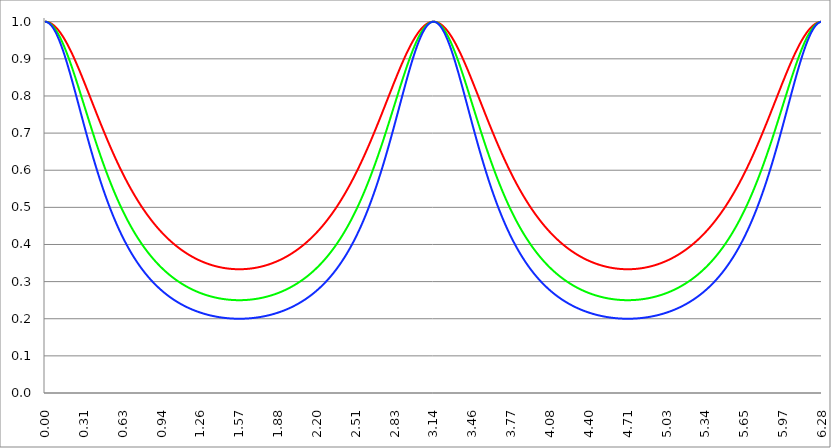
| Category | Series 1 | Series 0 | Series 2 |
|---|---|---|---|
| 0.0 | 1 | 1 | 1 |
| 0.00314159265358979 | 1 | 1 | 1 |
| 0.00628318530717958 | 1 | 1 | 1 |
| 0.00942477796076938 | 1 | 1 | 1 |
| 0.0125663706143592 | 1 | 1 | 0.999 |
| 0.015707963267949 | 1 | 0.999 | 0.999 |
| 0.0188495559215388 | 0.999 | 0.999 | 0.999 |
| 0.0219911485751285 | 0.999 | 0.999 | 0.998 |
| 0.0251327412287183 | 0.999 | 0.998 | 0.997 |
| 0.0282743338823081 | 0.998 | 0.998 | 0.997 |
| 0.0314159265358979 | 0.998 | 0.997 | 0.996 |
| 0.0345575191894877 | 0.998 | 0.996 | 0.995 |
| 0.0376991118430775 | 0.997 | 0.996 | 0.994 |
| 0.0408407044966673 | 0.997 | 0.995 | 0.993 |
| 0.0439822971502571 | 0.996 | 0.994 | 0.992 |
| 0.0471238898038469 | 0.996 | 0.993 | 0.991 |
| 0.0502654824574367 | 0.995 | 0.992 | 0.99 |
| 0.0534070751110265 | 0.994 | 0.992 | 0.989 |
| 0.0565486677646163 | 0.994 | 0.991 | 0.987 |
| 0.059690260418206 | 0.993 | 0.989 | 0.986 |
| 0.0628318530717958 | 0.992 | 0.988 | 0.984 |
| 0.0659734457253856 | 0.991 | 0.987 | 0.983 |
| 0.0691150383789754 | 0.991 | 0.986 | 0.981 |
| 0.0722566310325652 | 0.99 | 0.985 | 0.98 |
| 0.075398223686155 | 0.989 | 0.983 | 0.978 |
| 0.0785398163397448 | 0.988 | 0.982 | 0.976 |
| 0.0816814089933346 | 0.987 | 0.98 | 0.974 |
| 0.0848230016469244 | 0.986 | 0.979 | 0.972 |
| 0.0879645943005142 | 0.985 | 0.977 | 0.97 |
| 0.091106186954104 | 0.984 | 0.976 | 0.968 |
| 0.0942477796076937 | 0.983 | 0.974 | 0.966 |
| 0.0973893722612835 | 0.981 | 0.972 | 0.964 |
| 0.100530964914873 | 0.98 | 0.971 | 0.961 |
| 0.103672557568463 | 0.979 | 0.969 | 0.959 |
| 0.106814150222053 | 0.978 | 0.967 | 0.957 |
| 0.109955742875643 | 0.976 | 0.965 | 0.954 |
| 0.113097335529233 | 0.975 | 0.963 | 0.952 |
| 0.116238928182822 | 0.974 | 0.961 | 0.949 |
| 0.119380520836412 | 0.972 | 0.959 | 0.946 |
| 0.122522113490002 | 0.971 | 0.957 | 0.944 |
| 0.125663706143592 | 0.97 | 0.955 | 0.941 |
| 0.128805298797181 | 0.968 | 0.953 | 0.938 |
| 0.131946891450771 | 0.967 | 0.951 | 0.935 |
| 0.135088484104361 | 0.965 | 0.948 | 0.932 |
| 0.138230076757951 | 0.963 | 0.946 | 0.929 |
| 0.141371669411541 | 0.962 | 0.944 | 0.926 |
| 0.14451326206513 | 0.96 | 0.941 | 0.923 |
| 0.14765485471872 | 0.959 | 0.939 | 0.92 |
| 0.15079644737231 | 0.957 | 0.937 | 0.917 |
| 0.1539380400259 | 0.955 | 0.934 | 0.914 |
| 0.15707963267949 | 0.953 | 0.932 | 0.911 |
| 0.160221225333079 | 0.952 | 0.929 | 0.908 |
| 0.163362817986669 | 0.95 | 0.926 | 0.904 |
| 0.166504410640259 | 0.948 | 0.924 | 0.901 |
| 0.169646003293849 | 0.946 | 0.921 | 0.898 |
| 0.172787595947439 | 0.944 | 0.919 | 0.894 |
| 0.175929188601028 | 0.942 | 0.916 | 0.891 |
| 0.179070781254618 | 0.94 | 0.913 | 0.887 |
| 0.182212373908208 | 0.938 | 0.91 | 0.884 |
| 0.185353966561798 | 0.936 | 0.908 | 0.88 |
| 0.188495559215388 | 0.934 | 0.905 | 0.877 |
| 0.191637151868977 | 0.932 | 0.902 | 0.873 |
| 0.194778744522567 | 0.93 | 0.899 | 0.87 |
| 0.197920337176157 | 0.928 | 0.896 | 0.866 |
| 0.201061929829747 | 0.926 | 0.893 | 0.862 |
| 0.204203522483336 | 0.924 | 0.89 | 0.859 |
| 0.207345115136926 | 0.922 | 0.887 | 0.855 |
| 0.210486707790516 | 0.92 | 0.884 | 0.851 |
| 0.213628300444106 | 0.918 | 0.881 | 0.848 |
| 0.216769893097696 | 0.915 | 0.878 | 0.844 |
| 0.219911485751285 | 0.913 | 0.875 | 0.84 |
| 0.223053078404875 | 0.911 | 0.872 | 0.836 |
| 0.226194671058465 | 0.909 | 0.869 | 0.833 |
| 0.229336263712055 | 0.906 | 0.866 | 0.829 |
| 0.232477856365645 | 0.904 | 0.863 | 0.825 |
| 0.235619449019234 | 0.902 | 0.859 | 0.821 |
| 0.238761041672824 | 0.899 | 0.856 | 0.817 |
| 0.241902634326414 | 0.897 | 0.853 | 0.813 |
| 0.245044226980004 | 0.895 | 0.85 | 0.809 |
| 0.248185819633594 | 0.892 | 0.847 | 0.806 |
| 0.251327412287183 | 0.89 | 0.843 | 0.802 |
| 0.254469004940773 | 0.888 | 0.84 | 0.798 |
| 0.257610597594363 | 0.885 | 0.837 | 0.794 |
| 0.260752190247953 | 0.883 | 0.834 | 0.79 |
| 0.263893782901543 | 0.88 | 0.83 | 0.786 |
| 0.267035375555132 | 0.878 | 0.827 | 0.782 |
| 0.270176968208722 | 0.875 | 0.824 | 0.778 |
| 0.273318560862312 | 0.873 | 0.821 | 0.774 |
| 0.276460153515902 | 0.87 | 0.817 | 0.77 |
| 0.279601746169492 | 0.868 | 0.814 | 0.766 |
| 0.282743338823082 | 0.865 | 0.811 | 0.763 |
| 0.285884931476671 | 0.863 | 0.807 | 0.759 |
| 0.289026524130261 | 0.86 | 0.804 | 0.755 |
| 0.292168116783851 | 0.858 | 0.801 | 0.751 |
| 0.295309709437441 | 0.855 | 0.797 | 0.747 |
| 0.298451302091031 | 0.853 | 0.794 | 0.743 |
| 0.30159289474462 | 0.85 | 0.791 | 0.739 |
| 0.30473448739821 | 0.847 | 0.787 | 0.735 |
| 0.3078760800518 | 0.845 | 0.784 | 0.731 |
| 0.31101767270539 | 0.842 | 0.781 | 0.727 |
| 0.31415926535898 | 0.84 | 0.777 | 0.724 |
| 0.31730085801257 | 0.837 | 0.774 | 0.72 |
| 0.320442450666159 | 0.834 | 0.771 | 0.716 |
| 0.323584043319749 | 0.832 | 0.767 | 0.712 |
| 0.326725635973339 | 0.829 | 0.764 | 0.708 |
| 0.329867228626929 | 0.827 | 0.761 | 0.704 |
| 0.333008821280519 | 0.824 | 0.757 | 0.701 |
| 0.336150413934108 | 0.821 | 0.754 | 0.697 |
| 0.339292006587698 | 0.819 | 0.751 | 0.693 |
| 0.342433599241288 | 0.816 | 0.747 | 0.689 |
| 0.345575191894878 | 0.813 | 0.744 | 0.685 |
| 0.348716784548468 | 0.811 | 0.741 | 0.682 |
| 0.351858377202058 | 0.808 | 0.737 | 0.678 |
| 0.354999969855647 | 0.805 | 0.734 | 0.674 |
| 0.358141562509237 | 0.803 | 0.731 | 0.67 |
| 0.361283155162827 | 0.8 | 0.727 | 0.667 |
| 0.364424747816417 | 0.797 | 0.724 | 0.663 |
| 0.367566340470007 | 0.795 | 0.721 | 0.659 |
| 0.370707933123597 | 0.792 | 0.717 | 0.656 |
| 0.373849525777186 | 0.789 | 0.714 | 0.652 |
| 0.376991118430776 | 0.787 | 0.711 | 0.648 |
| 0.380132711084366 | 0.784 | 0.708 | 0.645 |
| 0.383274303737956 | 0.781 | 0.704 | 0.641 |
| 0.386415896391546 | 0.779 | 0.701 | 0.638 |
| 0.389557489045135 | 0.776 | 0.698 | 0.634 |
| 0.392699081698725 | 0.773 | 0.695 | 0.631 |
| 0.395840674352315 | 0.771 | 0.692 | 0.627 |
| 0.398982267005905 | 0.768 | 0.688 | 0.624 |
| 0.402123859659495 | 0.765 | 0.685 | 0.62 |
| 0.405265452313085 | 0.763 | 0.682 | 0.617 |
| 0.408407044966674 | 0.76 | 0.679 | 0.613 |
| 0.411548637620264 | 0.758 | 0.676 | 0.61 |
| 0.414690230273854 | 0.755 | 0.672 | 0.606 |
| 0.417831822927444 | 0.752 | 0.669 | 0.603 |
| 0.420973415581034 | 0.75 | 0.666 | 0.6 |
| 0.424115008234623 | 0.747 | 0.663 | 0.596 |
| 0.427256600888213 | 0.744 | 0.66 | 0.593 |
| 0.430398193541803 | 0.742 | 0.657 | 0.59 |
| 0.433539786195393 | 0.739 | 0.654 | 0.586 |
| 0.436681378848983 | 0.737 | 0.651 | 0.583 |
| 0.439822971502573 | 0.734 | 0.648 | 0.58 |
| 0.442964564156162 | 0.731 | 0.645 | 0.576 |
| 0.446106156809752 | 0.729 | 0.642 | 0.573 |
| 0.449247749463342 | 0.726 | 0.639 | 0.57 |
| 0.452389342116932 | 0.724 | 0.636 | 0.567 |
| 0.455530934770522 | 0.721 | 0.633 | 0.564 |
| 0.458672527424111 | 0.718 | 0.63 | 0.56 |
| 0.461814120077701 | 0.716 | 0.627 | 0.557 |
| 0.464955712731291 | 0.713 | 0.624 | 0.554 |
| 0.468097305384881 | 0.711 | 0.621 | 0.551 |
| 0.471238898038471 | 0.708 | 0.618 | 0.548 |
| 0.474380490692061 | 0.706 | 0.615 | 0.545 |
| 0.47752208334565 | 0.703 | 0.612 | 0.542 |
| 0.48066367599924 | 0.7 | 0.609 | 0.539 |
| 0.48380526865283 | 0.698 | 0.606 | 0.536 |
| 0.48694686130642 | 0.695 | 0.604 | 0.533 |
| 0.49008845396001 | 0.693 | 0.601 | 0.53 |
| 0.493230046613599 | 0.69 | 0.598 | 0.527 |
| 0.496371639267189 | 0.688 | 0.595 | 0.524 |
| 0.499513231920779 | 0.685 | 0.592 | 0.521 |
| 0.502654824574369 | 0.683 | 0.59 | 0.519 |
| 0.505796417227959 | 0.681 | 0.587 | 0.516 |
| 0.508938009881549 | 0.678 | 0.584 | 0.513 |
| 0.512079602535138 | 0.676 | 0.581 | 0.51 |
| 0.515221195188728 | 0.673 | 0.579 | 0.507 |
| 0.518362787842318 | 0.671 | 0.576 | 0.505 |
| 0.521504380495908 | 0.668 | 0.573 | 0.502 |
| 0.524645973149498 | 0.666 | 0.571 | 0.499 |
| 0.527787565803087 | 0.663 | 0.568 | 0.496 |
| 0.530929158456677 | 0.661 | 0.565 | 0.494 |
| 0.534070751110267 | 0.659 | 0.563 | 0.491 |
| 0.537212343763857 | 0.656 | 0.56 | 0.488 |
| 0.540353936417447 | 0.654 | 0.557 | 0.486 |
| 0.543495529071037 | 0.652 | 0.555 | 0.483 |
| 0.546637121724626 | 0.649 | 0.552 | 0.481 |
| 0.549778714378216 | 0.647 | 0.55 | 0.478 |
| 0.552920307031806 | 0.644 | 0.547 | 0.475 |
| 0.556061899685396 | 0.642 | 0.545 | 0.473 |
| 0.559203492338986 | 0.64 | 0.542 | 0.47 |
| 0.562345084992576 | 0.638 | 0.54 | 0.468 |
| 0.565486677646165 | 0.635 | 0.537 | 0.465 |
| 0.568628270299755 | 0.633 | 0.535 | 0.463 |
| 0.571769862953345 | 0.631 | 0.532 | 0.461 |
| 0.574911455606935 | 0.628 | 0.53 | 0.458 |
| 0.578053048260525 | 0.626 | 0.528 | 0.456 |
| 0.581194640914114 | 0.624 | 0.525 | 0.453 |
| 0.584336233567704 | 0.622 | 0.523 | 0.451 |
| 0.587477826221294 | 0.619 | 0.52 | 0.449 |
| 0.590619418874884 | 0.617 | 0.518 | 0.446 |
| 0.593761011528474 | 0.615 | 0.516 | 0.444 |
| 0.596902604182064 | 0.613 | 0.513 | 0.442 |
| 0.600044196835653 | 0.611 | 0.511 | 0.439 |
| 0.603185789489243 | 0.608 | 0.509 | 0.437 |
| 0.606327382142833 | 0.606 | 0.507 | 0.435 |
| 0.609468974796423 | 0.604 | 0.504 | 0.433 |
| 0.612610567450013 | 0.602 | 0.502 | 0.431 |
| 0.615752160103602 | 0.6 | 0.5 | 0.428 |
| 0.618893752757192 | 0.598 | 0.498 | 0.426 |
| 0.622035345410782 | 0.596 | 0.495 | 0.424 |
| 0.625176938064372 | 0.593 | 0.493 | 0.422 |
| 0.628318530717962 | 0.591 | 0.491 | 0.42 |
| 0.631460123371551 | 0.589 | 0.489 | 0.418 |
| 0.634601716025141 | 0.587 | 0.487 | 0.416 |
| 0.637743308678731 | 0.585 | 0.485 | 0.414 |
| 0.640884901332321 | 0.583 | 0.483 | 0.412 |
| 0.644026493985911 | 0.581 | 0.48 | 0.409 |
| 0.647168086639501 | 0.579 | 0.478 | 0.407 |
| 0.65030967929309 | 0.577 | 0.476 | 0.405 |
| 0.65345127194668 | 0.575 | 0.474 | 0.403 |
| 0.65659286460027 | 0.573 | 0.472 | 0.402 |
| 0.65973445725386 | 0.571 | 0.47 | 0.4 |
| 0.66287604990745 | 0.569 | 0.468 | 0.398 |
| 0.666017642561039 | 0.567 | 0.466 | 0.396 |
| 0.669159235214629 | 0.565 | 0.464 | 0.394 |
| 0.672300827868219 | 0.563 | 0.462 | 0.392 |
| 0.675442420521809 | 0.561 | 0.46 | 0.39 |
| 0.678584013175399 | 0.559 | 0.458 | 0.388 |
| 0.681725605828989 | 0.557 | 0.456 | 0.386 |
| 0.684867198482578 | 0.555 | 0.454 | 0.385 |
| 0.688008791136168 | 0.554 | 0.453 | 0.383 |
| 0.691150383789758 | 0.552 | 0.451 | 0.381 |
| 0.694291976443348 | 0.55 | 0.449 | 0.379 |
| 0.697433569096938 | 0.548 | 0.447 | 0.377 |
| 0.700575161750528 | 0.546 | 0.445 | 0.376 |
| 0.703716754404117 | 0.544 | 0.443 | 0.374 |
| 0.706858347057707 | 0.542 | 0.441 | 0.372 |
| 0.709999939711297 | 0.541 | 0.44 | 0.37 |
| 0.713141532364887 | 0.539 | 0.438 | 0.369 |
| 0.716283125018477 | 0.537 | 0.436 | 0.367 |
| 0.719424717672066 | 0.535 | 0.434 | 0.365 |
| 0.722566310325656 | 0.533 | 0.433 | 0.364 |
| 0.725707902979246 | 0.532 | 0.431 | 0.362 |
| 0.728849495632836 | 0.53 | 0.429 | 0.36 |
| 0.731991088286426 | 0.528 | 0.427 | 0.359 |
| 0.735132680940016 | 0.526 | 0.426 | 0.357 |
| 0.738274273593605 | 0.525 | 0.424 | 0.356 |
| 0.741415866247195 | 0.523 | 0.422 | 0.354 |
| 0.744557458900785 | 0.521 | 0.421 | 0.353 |
| 0.747699051554375 | 0.52 | 0.419 | 0.351 |
| 0.750840644207965 | 0.518 | 0.417 | 0.349 |
| 0.753982236861554 | 0.516 | 0.416 | 0.348 |
| 0.757123829515144 | 0.515 | 0.414 | 0.346 |
| 0.760265422168734 | 0.513 | 0.412 | 0.345 |
| 0.763407014822324 | 0.511 | 0.411 | 0.343 |
| 0.766548607475914 | 0.51 | 0.409 | 0.342 |
| 0.769690200129504 | 0.508 | 0.408 | 0.34 |
| 0.772831792783093 | 0.506 | 0.406 | 0.339 |
| 0.775973385436683 | 0.505 | 0.405 | 0.338 |
| 0.779114978090273 | 0.503 | 0.403 | 0.336 |
| 0.782256570743863 | 0.502 | 0.402 | 0.335 |
| 0.785398163397453 | 0.5 | 0.4 | 0.333 |
| 0.788539756051042 | 0.498 | 0.398 | 0.332 |
| 0.791681348704632 | 0.497 | 0.397 | 0.331 |
| 0.794822941358222 | 0.495 | 0.396 | 0.329 |
| 0.797964534011812 | 0.494 | 0.394 | 0.328 |
| 0.801106126665402 | 0.492 | 0.393 | 0.326 |
| 0.804247719318992 | 0.491 | 0.391 | 0.325 |
| 0.807389311972581 | 0.489 | 0.39 | 0.324 |
| 0.810530904626171 | 0.488 | 0.388 | 0.323 |
| 0.813672497279761 | 0.486 | 0.387 | 0.321 |
| 0.816814089933351 | 0.485 | 0.385 | 0.32 |
| 0.819955682586941 | 0.483 | 0.384 | 0.319 |
| 0.823097275240531 | 0.482 | 0.383 | 0.317 |
| 0.82623886789412 | 0.48 | 0.381 | 0.316 |
| 0.82938046054771 | 0.479 | 0.38 | 0.315 |
| 0.8325220532013 | 0.478 | 0.379 | 0.314 |
| 0.83566364585489 | 0.476 | 0.377 | 0.312 |
| 0.83880523850848 | 0.475 | 0.376 | 0.311 |
| 0.841946831162069 | 0.473 | 0.375 | 0.31 |
| 0.845088423815659 | 0.472 | 0.373 | 0.309 |
| 0.848230016469249 | 0.471 | 0.372 | 0.308 |
| 0.851371609122839 | 0.469 | 0.371 | 0.306 |
| 0.854513201776429 | 0.468 | 0.369 | 0.305 |
| 0.857654794430019 | 0.466 | 0.368 | 0.304 |
| 0.860796387083608 | 0.465 | 0.367 | 0.303 |
| 0.863937979737198 | 0.464 | 0.366 | 0.302 |
| 0.867079572390788 | 0.462 | 0.364 | 0.301 |
| 0.870221165044378 | 0.461 | 0.363 | 0.3 |
| 0.873362757697968 | 0.46 | 0.362 | 0.299 |
| 0.876504350351557 | 0.458 | 0.361 | 0.297 |
| 0.879645943005147 | 0.457 | 0.36 | 0.296 |
| 0.882787535658737 | 0.456 | 0.358 | 0.295 |
| 0.885929128312327 | 0.455 | 0.357 | 0.294 |
| 0.889070720965917 | 0.453 | 0.356 | 0.293 |
| 0.892212313619507 | 0.452 | 0.355 | 0.292 |
| 0.895353906273096 | 0.451 | 0.354 | 0.291 |
| 0.898495498926686 | 0.45 | 0.353 | 0.29 |
| 0.901637091580276 | 0.448 | 0.351 | 0.289 |
| 0.904778684233866 | 0.447 | 0.35 | 0.288 |
| 0.907920276887456 | 0.446 | 0.349 | 0.287 |
| 0.911061869541045 | 0.445 | 0.348 | 0.286 |
| 0.914203462194635 | 0.444 | 0.347 | 0.285 |
| 0.917345054848225 | 0.442 | 0.346 | 0.284 |
| 0.920486647501815 | 0.441 | 0.345 | 0.283 |
| 0.923628240155405 | 0.44 | 0.344 | 0.282 |
| 0.926769832808995 | 0.439 | 0.343 | 0.281 |
| 0.929911425462584 | 0.438 | 0.342 | 0.28 |
| 0.933053018116174 | 0.436 | 0.341 | 0.279 |
| 0.936194610769764 | 0.435 | 0.339 | 0.278 |
| 0.939336203423354 | 0.434 | 0.338 | 0.277 |
| 0.942477796076944 | 0.433 | 0.337 | 0.276 |
| 0.945619388730533 | 0.432 | 0.336 | 0.275 |
| 0.948760981384123 | 0.431 | 0.335 | 0.275 |
| 0.951902574037713 | 0.43 | 0.334 | 0.274 |
| 0.955044166691303 | 0.429 | 0.333 | 0.273 |
| 0.958185759344893 | 0.428 | 0.332 | 0.272 |
| 0.961327351998483 | 0.427 | 0.331 | 0.271 |
| 0.964468944652072 | 0.425 | 0.33 | 0.27 |
| 0.967610537305662 | 0.424 | 0.33 | 0.269 |
| 0.970752129959252 | 0.423 | 0.329 | 0.268 |
| 0.973893722612842 | 0.422 | 0.328 | 0.268 |
| 0.977035315266432 | 0.421 | 0.327 | 0.267 |
| 0.980176907920022 | 0.42 | 0.326 | 0.266 |
| 0.983318500573611 | 0.419 | 0.325 | 0.265 |
| 0.986460093227201 | 0.418 | 0.324 | 0.264 |
| 0.989601685880791 | 0.417 | 0.323 | 0.264 |
| 0.992743278534381 | 0.416 | 0.322 | 0.263 |
| 0.995884871187971 | 0.415 | 0.321 | 0.262 |
| 0.99902646384156 | 0.414 | 0.32 | 0.261 |
| 1.00216805649515 | 0.413 | 0.319 | 0.26 |
| 1.00530964914874 | 0.412 | 0.319 | 0.26 |
| 1.00845124180233 | 0.411 | 0.318 | 0.259 |
| 1.01159283445592 | 0.41 | 0.317 | 0.258 |
| 1.01473442710951 | 0.409 | 0.316 | 0.257 |
| 1.017876019763099 | 0.408 | 0.315 | 0.257 |
| 1.021017612416689 | 0.407 | 0.314 | 0.256 |
| 1.02415920507028 | 0.407 | 0.314 | 0.255 |
| 1.027300797723869 | 0.406 | 0.313 | 0.254 |
| 1.030442390377459 | 0.405 | 0.312 | 0.254 |
| 1.033583983031048 | 0.404 | 0.311 | 0.253 |
| 1.036725575684638 | 0.403 | 0.31 | 0.252 |
| 1.039867168338228 | 0.402 | 0.31 | 0.252 |
| 1.043008760991818 | 0.401 | 0.309 | 0.251 |
| 1.046150353645408 | 0.4 | 0.308 | 0.25 |
| 1.049291946298998 | 0.399 | 0.307 | 0.25 |
| 1.052433538952587 | 0.399 | 0.306 | 0.249 |
| 1.055575131606177 | 0.398 | 0.306 | 0.248 |
| 1.058716724259767 | 0.397 | 0.305 | 0.248 |
| 1.061858316913357 | 0.396 | 0.304 | 0.247 |
| 1.064999909566947 | 0.395 | 0.303 | 0.246 |
| 1.068141502220536 | 0.394 | 0.303 | 0.246 |
| 1.071283094874126 | 0.394 | 0.302 | 0.245 |
| 1.074424687527716 | 0.393 | 0.301 | 0.244 |
| 1.077566280181306 | 0.392 | 0.301 | 0.244 |
| 1.080707872834896 | 0.391 | 0.3 | 0.243 |
| 1.083849465488486 | 0.39 | 0.299 | 0.242 |
| 1.086991058142075 | 0.39 | 0.298 | 0.242 |
| 1.090132650795665 | 0.389 | 0.298 | 0.241 |
| 1.093274243449255 | 0.388 | 0.297 | 0.241 |
| 1.096415836102845 | 0.387 | 0.296 | 0.24 |
| 1.099557428756435 | 0.386 | 0.296 | 0.239 |
| 1.102699021410025 | 0.386 | 0.295 | 0.239 |
| 1.105840614063614 | 0.385 | 0.294 | 0.238 |
| 1.108982206717204 | 0.384 | 0.294 | 0.238 |
| 1.112123799370794 | 0.383 | 0.293 | 0.237 |
| 1.115265392024384 | 0.383 | 0.292 | 0.237 |
| 1.118406984677974 | 0.382 | 0.292 | 0.236 |
| 1.121548577331563 | 0.381 | 0.291 | 0.236 |
| 1.124690169985153 | 0.381 | 0.291 | 0.235 |
| 1.127831762638743 | 0.38 | 0.29 | 0.234 |
| 1.130973355292333 | 0.379 | 0.289 | 0.234 |
| 1.134114947945923 | 0.378 | 0.289 | 0.233 |
| 1.137256540599513 | 0.378 | 0.288 | 0.233 |
| 1.140398133253102 | 0.377 | 0.288 | 0.232 |
| 1.143539725906692 | 0.376 | 0.287 | 0.232 |
| 1.146681318560282 | 0.376 | 0.286 | 0.231 |
| 1.149822911213872 | 0.375 | 0.286 | 0.231 |
| 1.152964503867462 | 0.374 | 0.285 | 0.23 |
| 1.156106096521051 | 0.374 | 0.285 | 0.23 |
| 1.159247689174641 | 0.373 | 0.284 | 0.229 |
| 1.162389281828231 | 0.373 | 0.284 | 0.229 |
| 1.165530874481821 | 0.372 | 0.283 | 0.228 |
| 1.168672467135411 | 0.371 | 0.282 | 0.228 |
| 1.171814059789001 | 0.371 | 0.282 | 0.227 |
| 1.17495565244259 | 0.37 | 0.281 | 0.227 |
| 1.17809724509618 | 0.369 | 0.281 | 0.227 |
| 1.18123883774977 | 0.369 | 0.28 | 0.226 |
| 1.18438043040336 | 0.368 | 0.28 | 0.226 |
| 1.18752202305695 | 0.368 | 0.279 | 0.225 |
| 1.190663615710539 | 0.367 | 0.279 | 0.225 |
| 1.193805208364129 | 0.366 | 0.278 | 0.224 |
| 1.19694680101772 | 0.366 | 0.278 | 0.224 |
| 1.200088393671309 | 0.365 | 0.277 | 0.223 |
| 1.203229986324899 | 0.365 | 0.277 | 0.223 |
| 1.206371578978489 | 0.364 | 0.276 | 0.223 |
| 1.209513171632078 | 0.364 | 0.276 | 0.222 |
| 1.212654764285668 | 0.363 | 0.275 | 0.222 |
| 1.215796356939258 | 0.363 | 0.275 | 0.221 |
| 1.218937949592848 | 0.362 | 0.274 | 0.221 |
| 1.222079542246438 | 0.361 | 0.274 | 0.221 |
| 1.225221134900027 | 0.361 | 0.274 | 0.22 |
| 1.228362727553617 | 0.36 | 0.273 | 0.22 |
| 1.231504320207207 | 0.36 | 0.273 | 0.219 |
| 1.234645912860797 | 0.359 | 0.272 | 0.219 |
| 1.237787505514387 | 0.359 | 0.272 | 0.219 |
| 1.240929098167977 | 0.358 | 0.271 | 0.218 |
| 1.244070690821566 | 0.358 | 0.271 | 0.218 |
| 1.247212283475156 | 0.357 | 0.271 | 0.218 |
| 1.250353876128746 | 0.357 | 0.27 | 0.217 |
| 1.253495468782336 | 0.356 | 0.27 | 0.217 |
| 1.256637061435926 | 0.356 | 0.269 | 0.217 |
| 1.259778654089515 | 0.356 | 0.269 | 0.216 |
| 1.262920246743105 | 0.355 | 0.268 | 0.216 |
| 1.266061839396695 | 0.355 | 0.268 | 0.216 |
| 1.269203432050285 | 0.354 | 0.268 | 0.215 |
| 1.272345024703875 | 0.354 | 0.267 | 0.215 |
| 1.275486617357465 | 0.353 | 0.267 | 0.215 |
| 1.278628210011054 | 0.353 | 0.267 | 0.214 |
| 1.281769802664644 | 0.352 | 0.266 | 0.214 |
| 1.284911395318234 | 0.352 | 0.266 | 0.214 |
| 1.288052987971824 | 0.352 | 0.265 | 0.213 |
| 1.291194580625414 | 0.351 | 0.265 | 0.213 |
| 1.294336173279003 | 0.351 | 0.265 | 0.213 |
| 1.297477765932593 | 0.35 | 0.264 | 0.212 |
| 1.300619358586183 | 0.35 | 0.264 | 0.212 |
| 1.303760951239773 | 0.35 | 0.264 | 0.212 |
| 1.306902543893363 | 0.349 | 0.263 | 0.212 |
| 1.310044136546953 | 0.349 | 0.263 | 0.211 |
| 1.313185729200542 | 0.348 | 0.263 | 0.211 |
| 1.316327321854132 | 0.348 | 0.262 | 0.211 |
| 1.319468914507722 | 0.348 | 0.262 | 0.21 |
| 1.322610507161312 | 0.347 | 0.262 | 0.21 |
| 1.325752099814902 | 0.347 | 0.262 | 0.21 |
| 1.328893692468491 | 0.347 | 0.261 | 0.21 |
| 1.332035285122081 | 0.346 | 0.261 | 0.209 |
| 1.335176877775671 | 0.346 | 0.261 | 0.209 |
| 1.338318470429261 | 0.346 | 0.26 | 0.209 |
| 1.341460063082851 | 0.345 | 0.26 | 0.209 |
| 1.344601655736441 | 0.345 | 0.26 | 0.208 |
| 1.34774324839003 | 0.345 | 0.26 | 0.208 |
| 1.35088484104362 | 0.344 | 0.259 | 0.208 |
| 1.35402643369721 | 0.344 | 0.259 | 0.208 |
| 1.3571680263508 | 0.344 | 0.259 | 0.207 |
| 1.36030961900439 | 0.343 | 0.258 | 0.207 |
| 1.363451211657979 | 0.343 | 0.258 | 0.207 |
| 1.36659280431157 | 0.343 | 0.258 | 0.207 |
| 1.369734396965159 | 0.342 | 0.258 | 0.207 |
| 1.372875989618749 | 0.342 | 0.257 | 0.206 |
| 1.376017582272339 | 0.342 | 0.257 | 0.206 |
| 1.379159174925929 | 0.342 | 0.257 | 0.206 |
| 1.382300767579518 | 0.341 | 0.257 | 0.206 |
| 1.385442360233108 | 0.341 | 0.257 | 0.206 |
| 1.388583952886698 | 0.341 | 0.256 | 0.205 |
| 1.391725545540288 | 0.341 | 0.256 | 0.205 |
| 1.394867138193878 | 0.34 | 0.256 | 0.205 |
| 1.398008730847468 | 0.34 | 0.256 | 0.205 |
| 1.401150323501057 | 0.34 | 0.255 | 0.205 |
| 1.404291916154647 | 0.34 | 0.255 | 0.204 |
| 1.407433508808237 | 0.339 | 0.255 | 0.204 |
| 1.410575101461827 | 0.339 | 0.255 | 0.204 |
| 1.413716694115417 | 0.339 | 0.255 | 0.204 |
| 1.416858286769006 | 0.339 | 0.254 | 0.204 |
| 1.419999879422596 | 0.338 | 0.254 | 0.204 |
| 1.423141472076186 | 0.338 | 0.254 | 0.204 |
| 1.426283064729776 | 0.338 | 0.254 | 0.203 |
| 1.429424657383366 | 0.338 | 0.254 | 0.203 |
| 1.432566250036956 | 0.338 | 0.254 | 0.203 |
| 1.435707842690545 | 0.337 | 0.253 | 0.203 |
| 1.438849435344135 | 0.337 | 0.253 | 0.203 |
| 1.441991027997725 | 0.337 | 0.253 | 0.203 |
| 1.445132620651315 | 0.337 | 0.253 | 0.203 |
| 1.448274213304905 | 0.337 | 0.253 | 0.202 |
| 1.451415805958494 | 0.337 | 0.253 | 0.202 |
| 1.454557398612084 | 0.336 | 0.253 | 0.202 |
| 1.457698991265674 | 0.336 | 0.252 | 0.202 |
| 1.460840583919264 | 0.336 | 0.252 | 0.202 |
| 1.463982176572854 | 0.336 | 0.252 | 0.202 |
| 1.467123769226444 | 0.336 | 0.252 | 0.202 |
| 1.470265361880033 | 0.336 | 0.252 | 0.202 |
| 1.473406954533623 | 0.335 | 0.252 | 0.202 |
| 1.476548547187213 | 0.335 | 0.252 | 0.201 |
| 1.479690139840803 | 0.335 | 0.252 | 0.201 |
| 1.482831732494393 | 0.335 | 0.251 | 0.201 |
| 1.485973325147982 | 0.335 | 0.251 | 0.201 |
| 1.489114917801572 | 0.335 | 0.251 | 0.201 |
| 1.492256510455162 | 0.335 | 0.251 | 0.201 |
| 1.495398103108752 | 0.335 | 0.251 | 0.201 |
| 1.498539695762342 | 0.334 | 0.251 | 0.201 |
| 1.501681288415932 | 0.334 | 0.251 | 0.201 |
| 1.504822881069521 | 0.334 | 0.251 | 0.201 |
| 1.507964473723111 | 0.334 | 0.251 | 0.201 |
| 1.511106066376701 | 0.334 | 0.251 | 0.201 |
| 1.514247659030291 | 0.334 | 0.251 | 0.201 |
| 1.517389251683881 | 0.334 | 0.251 | 0.2 |
| 1.520530844337471 | 0.334 | 0.25 | 0.2 |
| 1.52367243699106 | 0.334 | 0.25 | 0.2 |
| 1.52681402964465 | 0.334 | 0.25 | 0.2 |
| 1.52995562229824 | 0.334 | 0.25 | 0.2 |
| 1.53309721495183 | 0.334 | 0.25 | 0.2 |
| 1.53623880760542 | 0.334 | 0.25 | 0.2 |
| 1.539380400259009 | 0.334 | 0.25 | 0.2 |
| 1.542521992912599 | 0.334 | 0.25 | 0.2 |
| 1.545663585566189 | 0.333 | 0.25 | 0.2 |
| 1.548805178219779 | 0.333 | 0.25 | 0.2 |
| 1.551946770873369 | 0.333 | 0.25 | 0.2 |
| 1.555088363526959 | 0.333 | 0.25 | 0.2 |
| 1.558229956180548 | 0.333 | 0.25 | 0.2 |
| 1.561371548834138 | 0.333 | 0.25 | 0.2 |
| 1.564513141487728 | 0.333 | 0.25 | 0.2 |
| 1.567654734141318 | 0.333 | 0.25 | 0.2 |
| 1.570796326794908 | 0.333 | 0.25 | 0.2 |
| 1.573937919448497 | 0.333 | 0.25 | 0.2 |
| 1.577079512102087 | 0.333 | 0.25 | 0.2 |
| 1.580221104755677 | 0.333 | 0.25 | 0.2 |
| 1.583362697409267 | 0.333 | 0.25 | 0.2 |
| 1.586504290062857 | 0.333 | 0.25 | 0.2 |
| 1.589645882716447 | 0.333 | 0.25 | 0.2 |
| 1.592787475370036 | 0.333 | 0.25 | 0.2 |
| 1.595929068023626 | 0.333 | 0.25 | 0.2 |
| 1.599070660677216 | 0.334 | 0.25 | 0.2 |
| 1.602212253330806 | 0.334 | 0.25 | 0.2 |
| 1.605353845984396 | 0.334 | 0.25 | 0.2 |
| 1.608495438637985 | 0.334 | 0.25 | 0.2 |
| 1.611637031291575 | 0.334 | 0.25 | 0.2 |
| 1.614778623945165 | 0.334 | 0.25 | 0.2 |
| 1.617920216598755 | 0.334 | 0.25 | 0.2 |
| 1.621061809252345 | 0.334 | 0.25 | 0.2 |
| 1.624203401905935 | 0.334 | 0.251 | 0.2 |
| 1.627344994559524 | 0.334 | 0.251 | 0.201 |
| 1.630486587213114 | 0.334 | 0.251 | 0.201 |
| 1.633628179866704 | 0.334 | 0.251 | 0.201 |
| 1.636769772520294 | 0.334 | 0.251 | 0.201 |
| 1.639911365173884 | 0.334 | 0.251 | 0.201 |
| 1.643052957827473 | 0.334 | 0.251 | 0.201 |
| 1.646194550481063 | 0.335 | 0.251 | 0.201 |
| 1.649336143134653 | 0.335 | 0.251 | 0.201 |
| 1.652477735788243 | 0.335 | 0.251 | 0.201 |
| 1.655619328441833 | 0.335 | 0.251 | 0.201 |
| 1.658760921095423 | 0.335 | 0.251 | 0.201 |
| 1.661902513749012 | 0.335 | 0.252 | 0.201 |
| 1.665044106402602 | 0.335 | 0.252 | 0.201 |
| 1.668185699056192 | 0.335 | 0.252 | 0.202 |
| 1.671327291709782 | 0.336 | 0.252 | 0.202 |
| 1.674468884363372 | 0.336 | 0.252 | 0.202 |
| 1.677610477016961 | 0.336 | 0.252 | 0.202 |
| 1.680752069670551 | 0.336 | 0.252 | 0.202 |
| 1.683893662324141 | 0.336 | 0.252 | 0.202 |
| 1.687035254977731 | 0.336 | 0.253 | 0.202 |
| 1.690176847631321 | 0.337 | 0.253 | 0.202 |
| 1.693318440284911 | 0.337 | 0.253 | 0.202 |
| 1.6964600329385 | 0.337 | 0.253 | 0.203 |
| 1.69960162559209 | 0.337 | 0.253 | 0.203 |
| 1.70274321824568 | 0.337 | 0.253 | 0.203 |
| 1.70588481089927 | 0.337 | 0.253 | 0.203 |
| 1.70902640355286 | 0.338 | 0.254 | 0.203 |
| 1.712167996206449 | 0.338 | 0.254 | 0.203 |
| 1.715309588860039 | 0.338 | 0.254 | 0.203 |
| 1.71845118151363 | 0.338 | 0.254 | 0.204 |
| 1.721592774167219 | 0.338 | 0.254 | 0.204 |
| 1.724734366820809 | 0.339 | 0.254 | 0.204 |
| 1.727875959474399 | 0.339 | 0.255 | 0.204 |
| 1.731017552127988 | 0.339 | 0.255 | 0.204 |
| 1.734159144781578 | 0.339 | 0.255 | 0.204 |
| 1.737300737435168 | 0.34 | 0.255 | 0.204 |
| 1.740442330088758 | 0.34 | 0.255 | 0.205 |
| 1.743583922742348 | 0.34 | 0.256 | 0.205 |
| 1.746725515395937 | 0.34 | 0.256 | 0.205 |
| 1.749867108049527 | 0.341 | 0.256 | 0.205 |
| 1.753008700703117 | 0.341 | 0.256 | 0.205 |
| 1.756150293356707 | 0.341 | 0.257 | 0.206 |
| 1.759291886010297 | 0.341 | 0.257 | 0.206 |
| 1.762433478663887 | 0.342 | 0.257 | 0.206 |
| 1.765575071317476 | 0.342 | 0.257 | 0.206 |
| 1.768716663971066 | 0.342 | 0.257 | 0.206 |
| 1.771858256624656 | 0.342 | 0.258 | 0.207 |
| 1.774999849278246 | 0.343 | 0.258 | 0.207 |
| 1.778141441931836 | 0.343 | 0.258 | 0.207 |
| 1.781283034585426 | 0.343 | 0.258 | 0.207 |
| 1.784424627239015 | 0.344 | 0.259 | 0.207 |
| 1.787566219892605 | 0.344 | 0.259 | 0.208 |
| 1.790707812546195 | 0.344 | 0.259 | 0.208 |
| 1.793849405199785 | 0.345 | 0.26 | 0.208 |
| 1.796990997853375 | 0.345 | 0.26 | 0.208 |
| 1.800132590506964 | 0.345 | 0.26 | 0.209 |
| 1.803274183160554 | 0.346 | 0.26 | 0.209 |
| 1.806415775814144 | 0.346 | 0.261 | 0.209 |
| 1.809557368467734 | 0.346 | 0.261 | 0.209 |
| 1.812698961121324 | 0.347 | 0.261 | 0.21 |
| 1.815840553774914 | 0.347 | 0.262 | 0.21 |
| 1.818982146428503 | 0.347 | 0.262 | 0.21 |
| 1.822123739082093 | 0.348 | 0.262 | 0.21 |
| 1.825265331735683 | 0.348 | 0.262 | 0.211 |
| 1.828406924389273 | 0.348 | 0.263 | 0.211 |
| 1.831548517042863 | 0.349 | 0.263 | 0.211 |
| 1.834690109696452 | 0.349 | 0.263 | 0.212 |
| 1.837831702350042 | 0.35 | 0.264 | 0.212 |
| 1.840973295003632 | 0.35 | 0.264 | 0.212 |
| 1.844114887657222 | 0.35 | 0.264 | 0.212 |
| 1.847256480310812 | 0.351 | 0.265 | 0.213 |
| 1.850398072964402 | 0.351 | 0.265 | 0.213 |
| 1.853539665617991 | 0.352 | 0.265 | 0.213 |
| 1.856681258271581 | 0.352 | 0.266 | 0.214 |
| 1.859822850925171 | 0.352 | 0.266 | 0.214 |
| 1.862964443578761 | 0.353 | 0.267 | 0.214 |
| 1.866106036232351 | 0.353 | 0.267 | 0.215 |
| 1.86924762888594 | 0.354 | 0.267 | 0.215 |
| 1.87238922153953 | 0.354 | 0.268 | 0.215 |
| 1.87553081419312 | 0.355 | 0.268 | 0.216 |
| 1.87867240684671 | 0.355 | 0.268 | 0.216 |
| 1.8818139995003 | 0.356 | 0.269 | 0.216 |
| 1.88495559215389 | 0.356 | 0.269 | 0.217 |
| 1.888097184807479 | 0.356 | 0.27 | 0.217 |
| 1.891238777461069 | 0.357 | 0.27 | 0.217 |
| 1.89438037011466 | 0.357 | 0.271 | 0.218 |
| 1.897521962768249 | 0.358 | 0.271 | 0.218 |
| 1.900663555421839 | 0.358 | 0.271 | 0.218 |
| 1.903805148075429 | 0.359 | 0.272 | 0.219 |
| 1.906946740729018 | 0.359 | 0.272 | 0.219 |
| 1.910088333382608 | 0.36 | 0.273 | 0.219 |
| 1.913229926036198 | 0.36 | 0.273 | 0.22 |
| 1.916371518689788 | 0.361 | 0.274 | 0.22 |
| 1.919513111343378 | 0.361 | 0.274 | 0.221 |
| 1.922654703996967 | 0.362 | 0.274 | 0.221 |
| 1.925796296650557 | 0.363 | 0.275 | 0.221 |
| 1.928937889304147 | 0.363 | 0.275 | 0.222 |
| 1.932079481957737 | 0.364 | 0.276 | 0.222 |
| 1.935221074611327 | 0.364 | 0.276 | 0.223 |
| 1.938362667264917 | 0.365 | 0.277 | 0.223 |
| 1.941504259918506 | 0.365 | 0.277 | 0.223 |
| 1.944645852572096 | 0.366 | 0.278 | 0.224 |
| 1.947787445225686 | 0.366 | 0.278 | 0.224 |
| 1.950929037879276 | 0.367 | 0.279 | 0.225 |
| 1.954070630532866 | 0.368 | 0.279 | 0.225 |
| 1.957212223186455 | 0.368 | 0.28 | 0.226 |
| 1.960353815840045 | 0.369 | 0.28 | 0.226 |
| 1.963495408493635 | 0.369 | 0.281 | 0.227 |
| 1.966637001147225 | 0.37 | 0.281 | 0.227 |
| 1.969778593800815 | 0.371 | 0.282 | 0.227 |
| 1.972920186454405 | 0.371 | 0.282 | 0.228 |
| 1.976061779107994 | 0.372 | 0.283 | 0.228 |
| 1.979203371761584 | 0.373 | 0.284 | 0.229 |
| 1.982344964415174 | 0.373 | 0.284 | 0.229 |
| 1.985486557068764 | 0.374 | 0.285 | 0.23 |
| 1.988628149722354 | 0.374 | 0.285 | 0.23 |
| 1.991769742375943 | 0.375 | 0.286 | 0.231 |
| 1.994911335029533 | 0.376 | 0.286 | 0.231 |
| 1.998052927683123 | 0.376 | 0.287 | 0.232 |
| 2.001194520336712 | 0.377 | 0.288 | 0.232 |
| 2.004336112990302 | 0.378 | 0.288 | 0.233 |
| 2.007477705643892 | 0.378 | 0.289 | 0.233 |
| 2.010619298297482 | 0.379 | 0.289 | 0.234 |
| 2.013760890951071 | 0.38 | 0.29 | 0.234 |
| 2.016902483604661 | 0.381 | 0.291 | 0.235 |
| 2.02004407625825 | 0.381 | 0.291 | 0.236 |
| 2.02318566891184 | 0.382 | 0.292 | 0.236 |
| 2.02632726156543 | 0.383 | 0.292 | 0.237 |
| 2.029468854219019 | 0.383 | 0.293 | 0.237 |
| 2.032610446872609 | 0.384 | 0.294 | 0.238 |
| 2.035752039526198 | 0.385 | 0.294 | 0.238 |
| 2.038893632179788 | 0.386 | 0.295 | 0.239 |
| 2.042035224833378 | 0.386 | 0.296 | 0.239 |
| 2.045176817486967 | 0.387 | 0.296 | 0.24 |
| 2.048318410140557 | 0.388 | 0.297 | 0.241 |
| 2.051460002794146 | 0.389 | 0.298 | 0.241 |
| 2.054601595447736 | 0.39 | 0.298 | 0.242 |
| 2.057743188101325 | 0.39 | 0.299 | 0.242 |
| 2.060884780754915 | 0.391 | 0.3 | 0.243 |
| 2.064026373408505 | 0.392 | 0.301 | 0.244 |
| 2.067167966062094 | 0.393 | 0.301 | 0.244 |
| 2.070309558715684 | 0.394 | 0.302 | 0.245 |
| 2.073451151369273 | 0.394 | 0.303 | 0.246 |
| 2.076592744022863 | 0.395 | 0.303 | 0.246 |
| 2.079734336676452 | 0.396 | 0.304 | 0.247 |
| 2.082875929330042 | 0.397 | 0.305 | 0.248 |
| 2.086017521983632 | 0.398 | 0.306 | 0.248 |
| 2.089159114637221 | 0.399 | 0.306 | 0.249 |
| 2.092300707290811 | 0.399 | 0.307 | 0.25 |
| 2.095442299944401 | 0.4 | 0.308 | 0.25 |
| 2.09858389259799 | 0.401 | 0.309 | 0.251 |
| 2.10172548525158 | 0.402 | 0.31 | 0.252 |
| 2.104867077905169 | 0.403 | 0.31 | 0.252 |
| 2.108008670558759 | 0.404 | 0.311 | 0.253 |
| 2.111150263212349 | 0.405 | 0.312 | 0.254 |
| 2.114291855865938 | 0.406 | 0.313 | 0.254 |
| 2.117433448519528 | 0.407 | 0.314 | 0.255 |
| 2.120575041173117 | 0.407 | 0.314 | 0.256 |
| 2.123716633826707 | 0.408 | 0.315 | 0.257 |
| 2.126858226480297 | 0.409 | 0.316 | 0.257 |
| 2.129999819133886 | 0.41 | 0.317 | 0.258 |
| 2.133141411787476 | 0.411 | 0.318 | 0.259 |
| 2.136283004441065 | 0.412 | 0.319 | 0.26 |
| 2.139424597094655 | 0.413 | 0.319 | 0.26 |
| 2.142566189748245 | 0.414 | 0.32 | 0.261 |
| 2.145707782401834 | 0.415 | 0.321 | 0.262 |
| 2.148849375055424 | 0.416 | 0.322 | 0.263 |
| 2.151990967709013 | 0.417 | 0.323 | 0.264 |
| 2.155132560362603 | 0.418 | 0.324 | 0.264 |
| 2.158274153016193 | 0.419 | 0.325 | 0.265 |
| 2.161415745669782 | 0.42 | 0.326 | 0.266 |
| 2.164557338323372 | 0.421 | 0.327 | 0.267 |
| 2.167698930976961 | 0.422 | 0.328 | 0.268 |
| 2.170840523630551 | 0.423 | 0.329 | 0.268 |
| 2.173982116284141 | 0.424 | 0.33 | 0.269 |
| 2.17712370893773 | 0.425 | 0.33 | 0.27 |
| 2.18026530159132 | 0.427 | 0.331 | 0.271 |
| 2.183406894244909 | 0.428 | 0.332 | 0.272 |
| 2.186548486898499 | 0.429 | 0.333 | 0.273 |
| 2.189690079552089 | 0.43 | 0.334 | 0.274 |
| 2.192831672205678 | 0.431 | 0.335 | 0.275 |
| 2.195973264859268 | 0.432 | 0.336 | 0.275 |
| 2.199114857512857 | 0.433 | 0.337 | 0.276 |
| 2.202256450166447 | 0.434 | 0.338 | 0.277 |
| 2.205398042820036 | 0.435 | 0.339 | 0.278 |
| 2.208539635473626 | 0.436 | 0.341 | 0.279 |
| 2.211681228127216 | 0.438 | 0.342 | 0.28 |
| 2.214822820780805 | 0.439 | 0.343 | 0.281 |
| 2.217964413434395 | 0.44 | 0.344 | 0.282 |
| 2.221106006087984 | 0.441 | 0.345 | 0.283 |
| 2.224247598741574 | 0.442 | 0.346 | 0.284 |
| 2.227389191395164 | 0.444 | 0.347 | 0.285 |
| 2.230530784048753 | 0.445 | 0.348 | 0.286 |
| 2.233672376702343 | 0.446 | 0.349 | 0.287 |
| 2.236813969355933 | 0.447 | 0.35 | 0.288 |
| 2.239955562009522 | 0.448 | 0.351 | 0.289 |
| 2.243097154663112 | 0.45 | 0.353 | 0.29 |
| 2.246238747316701 | 0.451 | 0.354 | 0.291 |
| 2.249380339970291 | 0.452 | 0.355 | 0.292 |
| 2.252521932623881 | 0.453 | 0.356 | 0.293 |
| 2.25566352527747 | 0.455 | 0.357 | 0.294 |
| 2.25880511793106 | 0.456 | 0.358 | 0.295 |
| 2.261946710584649 | 0.457 | 0.36 | 0.296 |
| 2.265088303238239 | 0.458 | 0.361 | 0.297 |
| 2.268229895891829 | 0.46 | 0.362 | 0.299 |
| 2.271371488545418 | 0.461 | 0.363 | 0.3 |
| 2.274513081199008 | 0.462 | 0.364 | 0.301 |
| 2.277654673852597 | 0.464 | 0.366 | 0.302 |
| 2.280796266506186 | 0.465 | 0.367 | 0.303 |
| 2.283937859159776 | 0.466 | 0.368 | 0.304 |
| 2.287079451813366 | 0.468 | 0.369 | 0.305 |
| 2.290221044466955 | 0.469 | 0.371 | 0.306 |
| 2.293362637120545 | 0.471 | 0.372 | 0.308 |
| 2.296504229774135 | 0.472 | 0.373 | 0.309 |
| 2.299645822427724 | 0.473 | 0.375 | 0.31 |
| 2.302787415081314 | 0.475 | 0.376 | 0.311 |
| 2.305929007734904 | 0.476 | 0.377 | 0.312 |
| 2.309070600388493 | 0.478 | 0.379 | 0.314 |
| 2.312212193042083 | 0.479 | 0.38 | 0.315 |
| 2.315353785695672 | 0.48 | 0.381 | 0.316 |
| 2.318495378349262 | 0.482 | 0.383 | 0.317 |
| 2.321636971002852 | 0.483 | 0.384 | 0.319 |
| 2.324778563656441 | 0.485 | 0.385 | 0.32 |
| 2.327920156310031 | 0.486 | 0.387 | 0.321 |
| 2.33106174896362 | 0.488 | 0.388 | 0.323 |
| 2.33420334161721 | 0.489 | 0.39 | 0.324 |
| 2.3373449342708 | 0.491 | 0.391 | 0.325 |
| 2.340486526924389 | 0.492 | 0.393 | 0.326 |
| 2.343628119577979 | 0.494 | 0.394 | 0.328 |
| 2.346769712231568 | 0.495 | 0.396 | 0.329 |
| 2.349911304885158 | 0.497 | 0.397 | 0.331 |
| 2.353052897538748 | 0.498 | 0.398 | 0.332 |
| 2.356194490192337 | 0.5 | 0.4 | 0.333 |
| 2.359336082845927 | 0.502 | 0.402 | 0.335 |
| 2.362477675499516 | 0.503 | 0.403 | 0.336 |
| 2.365619268153106 | 0.505 | 0.405 | 0.338 |
| 2.368760860806696 | 0.506 | 0.406 | 0.339 |
| 2.371902453460285 | 0.508 | 0.408 | 0.34 |
| 2.375044046113875 | 0.51 | 0.409 | 0.342 |
| 2.378185638767464 | 0.511 | 0.411 | 0.343 |
| 2.381327231421054 | 0.513 | 0.412 | 0.345 |
| 2.384468824074644 | 0.515 | 0.414 | 0.346 |
| 2.387610416728233 | 0.516 | 0.416 | 0.348 |
| 2.390752009381823 | 0.518 | 0.417 | 0.349 |
| 2.393893602035412 | 0.52 | 0.419 | 0.351 |
| 2.397035194689002 | 0.521 | 0.421 | 0.353 |
| 2.400176787342591 | 0.523 | 0.422 | 0.354 |
| 2.403318379996181 | 0.525 | 0.424 | 0.356 |
| 2.406459972649771 | 0.526 | 0.426 | 0.357 |
| 2.40960156530336 | 0.528 | 0.427 | 0.359 |
| 2.41274315795695 | 0.53 | 0.429 | 0.36 |
| 2.41588475061054 | 0.532 | 0.431 | 0.362 |
| 2.419026343264129 | 0.533 | 0.433 | 0.364 |
| 2.422167935917719 | 0.535 | 0.434 | 0.365 |
| 2.425309528571308 | 0.537 | 0.436 | 0.367 |
| 2.428451121224898 | 0.539 | 0.438 | 0.369 |
| 2.431592713878488 | 0.541 | 0.44 | 0.37 |
| 2.434734306532077 | 0.542 | 0.441 | 0.372 |
| 2.437875899185667 | 0.544 | 0.443 | 0.374 |
| 2.441017491839256 | 0.546 | 0.445 | 0.376 |
| 2.444159084492846 | 0.548 | 0.447 | 0.377 |
| 2.447300677146435 | 0.55 | 0.449 | 0.379 |
| 2.450442269800025 | 0.552 | 0.451 | 0.381 |
| 2.453583862453615 | 0.554 | 0.453 | 0.383 |
| 2.456725455107204 | 0.555 | 0.454 | 0.385 |
| 2.459867047760794 | 0.557 | 0.456 | 0.386 |
| 2.463008640414384 | 0.559 | 0.458 | 0.388 |
| 2.466150233067973 | 0.561 | 0.46 | 0.39 |
| 2.469291825721563 | 0.563 | 0.462 | 0.392 |
| 2.472433418375152 | 0.565 | 0.464 | 0.394 |
| 2.475575011028742 | 0.567 | 0.466 | 0.396 |
| 2.478716603682332 | 0.569 | 0.468 | 0.398 |
| 2.481858196335921 | 0.571 | 0.47 | 0.4 |
| 2.48499978898951 | 0.573 | 0.472 | 0.402 |
| 2.4881413816431 | 0.575 | 0.474 | 0.403 |
| 2.49128297429669 | 0.577 | 0.476 | 0.405 |
| 2.49442456695028 | 0.579 | 0.478 | 0.407 |
| 2.497566159603869 | 0.581 | 0.48 | 0.409 |
| 2.500707752257458 | 0.583 | 0.483 | 0.412 |
| 2.503849344911048 | 0.585 | 0.485 | 0.414 |
| 2.506990937564638 | 0.587 | 0.487 | 0.416 |
| 2.510132530218228 | 0.589 | 0.489 | 0.418 |
| 2.513274122871817 | 0.591 | 0.491 | 0.42 |
| 2.516415715525407 | 0.593 | 0.493 | 0.422 |
| 2.519557308178996 | 0.596 | 0.495 | 0.424 |
| 2.522698900832586 | 0.598 | 0.498 | 0.426 |
| 2.525840493486176 | 0.6 | 0.5 | 0.428 |
| 2.528982086139765 | 0.602 | 0.502 | 0.431 |
| 2.532123678793355 | 0.604 | 0.504 | 0.433 |
| 2.535265271446944 | 0.606 | 0.507 | 0.435 |
| 2.538406864100534 | 0.608 | 0.509 | 0.437 |
| 2.541548456754124 | 0.611 | 0.511 | 0.439 |
| 2.544690049407713 | 0.613 | 0.513 | 0.442 |
| 2.547831642061302 | 0.615 | 0.516 | 0.444 |
| 2.550973234714892 | 0.617 | 0.518 | 0.446 |
| 2.554114827368482 | 0.619 | 0.52 | 0.449 |
| 2.557256420022072 | 0.622 | 0.523 | 0.451 |
| 2.560398012675661 | 0.624 | 0.525 | 0.453 |
| 2.563539605329251 | 0.626 | 0.528 | 0.456 |
| 2.56668119798284 | 0.628 | 0.53 | 0.458 |
| 2.56982279063643 | 0.631 | 0.532 | 0.461 |
| 2.57296438329002 | 0.633 | 0.535 | 0.463 |
| 2.576105975943609 | 0.635 | 0.537 | 0.465 |
| 2.579247568597199 | 0.638 | 0.54 | 0.468 |
| 2.582389161250788 | 0.64 | 0.542 | 0.47 |
| 2.585530753904377 | 0.642 | 0.545 | 0.473 |
| 2.588672346557967 | 0.644 | 0.547 | 0.475 |
| 2.591813939211557 | 0.647 | 0.55 | 0.478 |
| 2.594955531865147 | 0.649 | 0.552 | 0.481 |
| 2.598097124518736 | 0.652 | 0.555 | 0.483 |
| 2.601238717172326 | 0.654 | 0.557 | 0.486 |
| 2.604380309825915 | 0.656 | 0.56 | 0.488 |
| 2.607521902479505 | 0.659 | 0.563 | 0.491 |
| 2.610663495133095 | 0.661 | 0.565 | 0.494 |
| 2.613805087786684 | 0.663 | 0.568 | 0.496 |
| 2.616946680440274 | 0.666 | 0.571 | 0.499 |
| 2.620088273093863 | 0.668 | 0.573 | 0.502 |
| 2.623229865747452 | 0.671 | 0.576 | 0.505 |
| 2.626371458401042 | 0.673 | 0.579 | 0.507 |
| 2.629513051054632 | 0.676 | 0.581 | 0.51 |
| 2.632654643708222 | 0.678 | 0.584 | 0.513 |
| 2.635796236361811 | 0.681 | 0.587 | 0.516 |
| 2.638937829015401 | 0.683 | 0.59 | 0.519 |
| 2.642079421668991 | 0.685 | 0.592 | 0.521 |
| 2.64522101432258 | 0.688 | 0.595 | 0.524 |
| 2.64836260697617 | 0.69 | 0.598 | 0.527 |
| 2.651504199629759 | 0.693 | 0.601 | 0.53 |
| 2.654645792283349 | 0.695 | 0.604 | 0.533 |
| 2.657787384936938 | 0.698 | 0.606 | 0.536 |
| 2.660928977590528 | 0.7 | 0.609 | 0.539 |
| 2.664070570244118 | 0.703 | 0.612 | 0.542 |
| 2.667212162897707 | 0.706 | 0.615 | 0.545 |
| 2.670353755551297 | 0.708 | 0.618 | 0.548 |
| 2.673495348204887 | 0.711 | 0.621 | 0.551 |
| 2.676636940858476 | 0.713 | 0.624 | 0.554 |
| 2.679778533512066 | 0.716 | 0.627 | 0.557 |
| 2.682920126165655 | 0.718 | 0.63 | 0.56 |
| 2.686061718819245 | 0.721 | 0.633 | 0.564 |
| 2.689203311472835 | 0.724 | 0.636 | 0.567 |
| 2.692344904126424 | 0.726 | 0.639 | 0.57 |
| 2.695486496780014 | 0.729 | 0.642 | 0.573 |
| 2.698628089433603 | 0.731 | 0.645 | 0.576 |
| 2.701769682087193 | 0.734 | 0.648 | 0.58 |
| 2.704911274740782 | 0.737 | 0.651 | 0.583 |
| 2.708052867394372 | 0.739 | 0.654 | 0.586 |
| 2.711194460047962 | 0.742 | 0.657 | 0.59 |
| 2.714336052701551 | 0.744 | 0.66 | 0.593 |
| 2.717477645355141 | 0.747 | 0.663 | 0.596 |
| 2.720619238008731 | 0.75 | 0.666 | 0.6 |
| 2.72376083066232 | 0.752 | 0.669 | 0.603 |
| 2.72690242331591 | 0.755 | 0.672 | 0.606 |
| 2.730044015969499 | 0.758 | 0.676 | 0.61 |
| 2.733185608623089 | 0.76 | 0.679 | 0.613 |
| 2.736327201276678 | 0.763 | 0.682 | 0.617 |
| 2.739468793930268 | 0.765 | 0.685 | 0.62 |
| 2.742610386583858 | 0.768 | 0.688 | 0.624 |
| 2.745751979237447 | 0.771 | 0.692 | 0.627 |
| 2.748893571891036 | 0.773 | 0.695 | 0.631 |
| 2.752035164544627 | 0.776 | 0.698 | 0.634 |
| 2.755176757198216 | 0.779 | 0.701 | 0.638 |
| 2.758318349851806 | 0.781 | 0.704 | 0.641 |
| 2.761459942505395 | 0.784 | 0.708 | 0.645 |
| 2.764601535158985 | 0.787 | 0.711 | 0.648 |
| 2.767743127812574 | 0.789 | 0.714 | 0.652 |
| 2.770884720466164 | 0.792 | 0.717 | 0.656 |
| 2.774026313119754 | 0.795 | 0.721 | 0.659 |
| 2.777167905773343 | 0.797 | 0.724 | 0.663 |
| 2.780309498426932 | 0.8 | 0.727 | 0.667 |
| 2.783451091080522 | 0.803 | 0.731 | 0.67 |
| 2.786592683734112 | 0.805 | 0.734 | 0.674 |
| 2.789734276387701 | 0.808 | 0.737 | 0.678 |
| 2.792875869041291 | 0.811 | 0.741 | 0.682 |
| 2.796017461694881 | 0.813 | 0.744 | 0.685 |
| 2.79915905434847 | 0.816 | 0.747 | 0.689 |
| 2.80230064700206 | 0.819 | 0.751 | 0.693 |
| 2.80544223965565 | 0.821 | 0.754 | 0.697 |
| 2.808583832309239 | 0.824 | 0.757 | 0.701 |
| 2.811725424962829 | 0.827 | 0.761 | 0.704 |
| 2.814867017616419 | 0.829 | 0.764 | 0.708 |
| 2.818008610270008 | 0.832 | 0.767 | 0.712 |
| 2.821150202923598 | 0.834 | 0.771 | 0.716 |
| 2.824291795577187 | 0.837 | 0.774 | 0.72 |
| 2.827433388230777 | 0.84 | 0.777 | 0.724 |
| 2.830574980884366 | 0.842 | 0.781 | 0.727 |
| 2.833716573537956 | 0.845 | 0.784 | 0.731 |
| 2.836858166191546 | 0.847 | 0.787 | 0.735 |
| 2.839999758845135 | 0.85 | 0.791 | 0.739 |
| 2.843141351498725 | 0.853 | 0.794 | 0.743 |
| 2.846282944152314 | 0.855 | 0.797 | 0.747 |
| 2.849424536805904 | 0.858 | 0.801 | 0.751 |
| 2.852566129459494 | 0.86 | 0.804 | 0.755 |
| 2.855707722113083 | 0.863 | 0.807 | 0.759 |
| 2.858849314766673 | 0.865 | 0.811 | 0.763 |
| 2.861990907420262 | 0.868 | 0.814 | 0.766 |
| 2.865132500073852 | 0.87 | 0.817 | 0.77 |
| 2.868274092727442 | 0.873 | 0.821 | 0.774 |
| 2.871415685381031 | 0.875 | 0.824 | 0.778 |
| 2.874557278034621 | 0.878 | 0.827 | 0.782 |
| 2.87769887068821 | 0.88 | 0.83 | 0.786 |
| 2.8808404633418 | 0.883 | 0.834 | 0.79 |
| 2.88398205599539 | 0.885 | 0.837 | 0.794 |
| 2.88712364864898 | 0.888 | 0.84 | 0.798 |
| 2.890265241302569 | 0.89 | 0.843 | 0.802 |
| 2.893406833956158 | 0.892 | 0.847 | 0.806 |
| 2.896548426609748 | 0.895 | 0.85 | 0.809 |
| 2.899690019263338 | 0.897 | 0.853 | 0.813 |
| 2.902831611916927 | 0.899 | 0.856 | 0.817 |
| 2.905973204570517 | 0.902 | 0.859 | 0.821 |
| 2.909114797224106 | 0.904 | 0.863 | 0.825 |
| 2.912256389877696 | 0.906 | 0.866 | 0.829 |
| 2.915397982531286 | 0.909 | 0.869 | 0.833 |
| 2.918539575184875 | 0.911 | 0.872 | 0.836 |
| 2.921681167838465 | 0.913 | 0.875 | 0.84 |
| 2.924822760492054 | 0.915 | 0.878 | 0.844 |
| 2.927964353145644 | 0.918 | 0.881 | 0.848 |
| 2.931105945799234 | 0.92 | 0.884 | 0.851 |
| 2.934247538452823 | 0.922 | 0.887 | 0.855 |
| 2.937389131106413 | 0.924 | 0.89 | 0.859 |
| 2.940530723760002 | 0.926 | 0.893 | 0.862 |
| 2.943672316413592 | 0.928 | 0.896 | 0.866 |
| 2.946813909067182 | 0.93 | 0.899 | 0.87 |
| 2.949955501720771 | 0.932 | 0.902 | 0.873 |
| 2.953097094374361 | 0.934 | 0.905 | 0.877 |
| 2.95623868702795 | 0.936 | 0.908 | 0.88 |
| 2.95938027968154 | 0.938 | 0.91 | 0.884 |
| 2.96252187233513 | 0.94 | 0.913 | 0.887 |
| 2.965663464988719 | 0.942 | 0.916 | 0.891 |
| 2.968805057642309 | 0.944 | 0.919 | 0.894 |
| 2.971946650295898 | 0.946 | 0.921 | 0.898 |
| 2.975088242949488 | 0.948 | 0.924 | 0.901 |
| 2.978229835603078 | 0.95 | 0.926 | 0.904 |
| 2.981371428256667 | 0.952 | 0.929 | 0.908 |
| 2.984513020910257 | 0.953 | 0.932 | 0.911 |
| 2.987654613563846 | 0.955 | 0.934 | 0.914 |
| 2.990796206217436 | 0.957 | 0.937 | 0.917 |
| 2.993937798871025 | 0.959 | 0.939 | 0.92 |
| 2.997079391524615 | 0.96 | 0.941 | 0.923 |
| 3.000220984178205 | 0.962 | 0.944 | 0.926 |
| 3.003362576831794 | 0.963 | 0.946 | 0.929 |
| 3.006504169485384 | 0.965 | 0.948 | 0.932 |
| 3.009645762138974 | 0.967 | 0.951 | 0.935 |
| 3.012787354792563 | 0.968 | 0.953 | 0.938 |
| 3.015928947446153 | 0.97 | 0.955 | 0.941 |
| 3.019070540099742 | 0.971 | 0.957 | 0.944 |
| 3.022212132753332 | 0.972 | 0.959 | 0.946 |
| 3.025353725406922 | 0.974 | 0.961 | 0.949 |
| 3.028495318060511 | 0.975 | 0.963 | 0.952 |
| 3.031636910714101 | 0.976 | 0.965 | 0.954 |
| 3.03477850336769 | 0.978 | 0.967 | 0.957 |
| 3.03792009602128 | 0.979 | 0.969 | 0.959 |
| 3.04106168867487 | 0.98 | 0.971 | 0.961 |
| 3.04420328132846 | 0.981 | 0.972 | 0.964 |
| 3.047344873982049 | 0.983 | 0.974 | 0.966 |
| 3.050486466635638 | 0.984 | 0.976 | 0.968 |
| 3.053628059289228 | 0.985 | 0.977 | 0.97 |
| 3.056769651942818 | 0.986 | 0.979 | 0.972 |
| 3.059911244596407 | 0.987 | 0.98 | 0.974 |
| 3.063052837249997 | 0.988 | 0.982 | 0.976 |
| 3.066194429903586 | 0.989 | 0.983 | 0.978 |
| 3.069336022557176 | 0.99 | 0.985 | 0.98 |
| 3.072477615210766 | 0.991 | 0.986 | 0.981 |
| 3.075619207864355 | 0.991 | 0.987 | 0.983 |
| 3.078760800517945 | 0.992 | 0.988 | 0.984 |
| 3.081902393171534 | 0.993 | 0.989 | 0.986 |
| 3.085043985825124 | 0.994 | 0.991 | 0.987 |
| 3.088185578478713 | 0.994 | 0.992 | 0.989 |
| 3.091327171132303 | 0.995 | 0.992 | 0.99 |
| 3.094468763785893 | 0.996 | 0.993 | 0.991 |
| 3.097610356439482 | 0.996 | 0.994 | 0.992 |
| 3.100751949093072 | 0.997 | 0.995 | 0.993 |
| 3.103893541746661 | 0.997 | 0.996 | 0.994 |
| 3.107035134400251 | 0.998 | 0.996 | 0.995 |
| 3.110176727053841 | 0.998 | 0.997 | 0.996 |
| 3.11331831970743 | 0.998 | 0.998 | 0.997 |
| 3.11645991236102 | 0.999 | 0.998 | 0.997 |
| 3.11960150501461 | 0.999 | 0.999 | 0.998 |
| 3.122743097668199 | 0.999 | 0.999 | 0.999 |
| 3.125884690321789 | 1 | 0.999 | 0.999 |
| 3.129026282975378 | 1 | 1 | 0.999 |
| 3.132167875628968 | 1 | 1 | 1 |
| 3.135309468282557 | 1 | 1 | 1 |
| 3.138451060936147 | 1 | 1 | 1 |
| 3.141592653589737 | 1 | 1 | 1 |
| 3.144734246243326 | 1 | 1 | 1 |
| 3.147875838896916 | 1 | 1 | 1 |
| 3.151017431550505 | 1 | 1 | 1 |
| 3.154159024204095 | 1 | 1 | 0.999 |
| 3.157300616857685 | 1 | 0.999 | 0.999 |
| 3.160442209511274 | 0.999 | 0.999 | 0.999 |
| 3.163583802164864 | 0.999 | 0.999 | 0.998 |
| 3.166725394818453 | 0.999 | 0.998 | 0.997 |
| 3.169866987472043 | 0.998 | 0.998 | 0.997 |
| 3.173008580125633 | 0.998 | 0.997 | 0.996 |
| 3.176150172779222 | 0.998 | 0.996 | 0.995 |
| 3.179291765432812 | 0.997 | 0.996 | 0.994 |
| 3.182433358086401 | 0.997 | 0.995 | 0.993 |
| 3.185574950739991 | 0.996 | 0.994 | 0.992 |
| 3.188716543393581 | 0.996 | 0.993 | 0.991 |
| 3.19185813604717 | 0.995 | 0.992 | 0.99 |
| 3.19499972870076 | 0.994 | 0.992 | 0.989 |
| 3.198141321354349 | 0.994 | 0.991 | 0.987 |
| 3.20128291400794 | 0.993 | 0.989 | 0.986 |
| 3.204424506661528 | 0.992 | 0.988 | 0.984 |
| 3.207566099315118 | 0.991 | 0.987 | 0.983 |
| 3.210707691968708 | 0.991 | 0.986 | 0.981 |
| 3.213849284622297 | 0.99 | 0.985 | 0.98 |
| 3.216990877275887 | 0.989 | 0.983 | 0.978 |
| 3.220132469929476 | 0.988 | 0.982 | 0.976 |
| 3.223274062583066 | 0.987 | 0.98 | 0.974 |
| 3.226415655236656 | 0.986 | 0.979 | 0.972 |
| 3.229557247890245 | 0.985 | 0.977 | 0.97 |
| 3.232698840543835 | 0.984 | 0.976 | 0.968 |
| 3.235840433197425 | 0.983 | 0.974 | 0.966 |
| 3.238982025851014 | 0.981 | 0.972 | 0.964 |
| 3.242123618504604 | 0.98 | 0.971 | 0.961 |
| 3.245265211158193 | 0.979 | 0.969 | 0.959 |
| 3.248406803811783 | 0.978 | 0.967 | 0.957 |
| 3.251548396465373 | 0.976 | 0.965 | 0.954 |
| 3.254689989118962 | 0.975 | 0.963 | 0.952 |
| 3.257831581772551 | 0.974 | 0.961 | 0.949 |
| 3.260973174426141 | 0.972 | 0.959 | 0.946 |
| 3.26411476707973 | 0.971 | 0.957 | 0.944 |
| 3.267256359733321 | 0.97 | 0.955 | 0.941 |
| 3.27039795238691 | 0.968 | 0.953 | 0.938 |
| 3.2735395450405 | 0.967 | 0.951 | 0.935 |
| 3.276681137694089 | 0.965 | 0.948 | 0.932 |
| 3.279822730347679 | 0.963 | 0.946 | 0.929 |
| 3.282964323001269 | 0.962 | 0.944 | 0.926 |
| 3.286105915654858 | 0.96 | 0.941 | 0.923 |
| 3.289247508308448 | 0.959 | 0.939 | 0.92 |
| 3.292389100962037 | 0.957 | 0.937 | 0.917 |
| 3.295530693615627 | 0.955 | 0.934 | 0.914 |
| 3.298672286269217 | 0.953 | 0.932 | 0.911 |
| 3.301813878922806 | 0.952 | 0.929 | 0.908 |
| 3.304955471576396 | 0.95 | 0.926 | 0.904 |
| 3.308097064229985 | 0.948 | 0.924 | 0.901 |
| 3.311238656883575 | 0.946 | 0.921 | 0.898 |
| 3.314380249537165 | 0.944 | 0.919 | 0.894 |
| 3.317521842190754 | 0.942 | 0.916 | 0.891 |
| 3.320663434844344 | 0.94 | 0.913 | 0.887 |
| 3.323805027497933 | 0.938 | 0.91 | 0.884 |
| 3.326946620151523 | 0.936 | 0.908 | 0.88 |
| 3.330088212805113 | 0.934 | 0.905 | 0.877 |
| 3.333229805458702 | 0.932 | 0.902 | 0.873 |
| 3.336371398112292 | 0.93 | 0.899 | 0.87 |
| 3.339512990765881 | 0.928 | 0.896 | 0.866 |
| 3.342654583419471 | 0.926 | 0.893 | 0.862 |
| 3.345796176073061 | 0.924 | 0.89 | 0.859 |
| 3.34893776872665 | 0.922 | 0.887 | 0.855 |
| 3.35207936138024 | 0.92 | 0.884 | 0.851 |
| 3.355220954033829 | 0.918 | 0.881 | 0.848 |
| 3.358362546687419 | 0.915 | 0.878 | 0.844 |
| 3.361504139341009 | 0.913 | 0.875 | 0.84 |
| 3.364645731994598 | 0.911 | 0.872 | 0.836 |
| 3.367787324648188 | 0.909 | 0.869 | 0.833 |
| 3.370928917301777 | 0.906 | 0.866 | 0.829 |
| 3.374070509955367 | 0.904 | 0.863 | 0.825 |
| 3.377212102608956 | 0.902 | 0.859 | 0.821 |
| 3.380353695262546 | 0.899 | 0.856 | 0.817 |
| 3.383495287916136 | 0.897 | 0.853 | 0.813 |
| 3.386636880569725 | 0.895 | 0.85 | 0.809 |
| 3.389778473223315 | 0.892 | 0.847 | 0.806 |
| 3.392920065876904 | 0.89 | 0.843 | 0.802 |
| 3.396061658530494 | 0.888 | 0.84 | 0.798 |
| 3.399203251184084 | 0.885 | 0.837 | 0.794 |
| 3.402344843837673 | 0.883 | 0.834 | 0.79 |
| 3.405486436491263 | 0.88 | 0.83 | 0.786 |
| 3.408628029144852 | 0.878 | 0.827 | 0.782 |
| 3.411769621798442 | 0.875 | 0.824 | 0.778 |
| 3.414911214452032 | 0.873 | 0.821 | 0.774 |
| 3.418052807105621 | 0.87 | 0.817 | 0.77 |
| 3.421194399759211 | 0.868 | 0.814 | 0.766 |
| 3.4243359924128 | 0.865 | 0.811 | 0.763 |
| 3.42747758506639 | 0.863 | 0.807 | 0.759 |
| 3.43061917771998 | 0.86 | 0.804 | 0.755 |
| 3.433760770373569 | 0.858 | 0.801 | 0.751 |
| 3.436902363027159 | 0.855 | 0.797 | 0.747 |
| 3.440043955680748 | 0.853 | 0.794 | 0.743 |
| 3.443185548334338 | 0.85 | 0.791 | 0.739 |
| 3.446327140987927 | 0.847 | 0.787 | 0.735 |
| 3.449468733641517 | 0.845 | 0.784 | 0.731 |
| 3.452610326295107 | 0.842 | 0.781 | 0.727 |
| 3.455751918948696 | 0.84 | 0.777 | 0.724 |
| 3.458893511602286 | 0.837 | 0.774 | 0.72 |
| 3.462035104255876 | 0.834 | 0.771 | 0.716 |
| 3.465176696909465 | 0.832 | 0.767 | 0.712 |
| 3.468318289563055 | 0.829 | 0.764 | 0.708 |
| 3.471459882216644 | 0.827 | 0.761 | 0.704 |
| 3.474601474870234 | 0.824 | 0.757 | 0.701 |
| 3.477743067523824 | 0.821 | 0.754 | 0.697 |
| 3.480884660177413 | 0.819 | 0.751 | 0.693 |
| 3.484026252831002 | 0.816 | 0.747 | 0.689 |
| 3.487167845484592 | 0.813 | 0.744 | 0.685 |
| 3.490309438138182 | 0.811 | 0.741 | 0.682 |
| 3.493451030791772 | 0.808 | 0.737 | 0.678 |
| 3.496592623445361 | 0.805 | 0.734 | 0.674 |
| 3.499734216098951 | 0.803 | 0.731 | 0.67 |
| 3.50287580875254 | 0.8 | 0.727 | 0.667 |
| 3.50601740140613 | 0.797 | 0.724 | 0.663 |
| 3.50915899405972 | 0.795 | 0.721 | 0.659 |
| 3.512300586713309 | 0.792 | 0.717 | 0.656 |
| 3.515442179366899 | 0.789 | 0.714 | 0.652 |
| 3.518583772020488 | 0.787 | 0.711 | 0.648 |
| 3.521725364674078 | 0.784 | 0.708 | 0.645 |
| 3.524866957327668 | 0.781 | 0.704 | 0.641 |
| 3.528008549981257 | 0.779 | 0.701 | 0.638 |
| 3.531150142634847 | 0.776 | 0.698 | 0.634 |
| 3.534291735288436 | 0.773 | 0.695 | 0.631 |
| 3.537433327942026 | 0.771 | 0.692 | 0.627 |
| 3.540574920595616 | 0.768 | 0.688 | 0.624 |
| 3.543716513249205 | 0.765 | 0.685 | 0.62 |
| 3.546858105902795 | 0.763 | 0.682 | 0.617 |
| 3.549999698556384 | 0.76 | 0.679 | 0.613 |
| 3.553141291209974 | 0.758 | 0.676 | 0.61 |
| 3.556282883863564 | 0.755 | 0.672 | 0.606 |
| 3.559424476517153 | 0.752 | 0.669 | 0.603 |
| 3.562566069170743 | 0.75 | 0.666 | 0.6 |
| 3.565707661824332 | 0.747 | 0.663 | 0.596 |
| 3.568849254477922 | 0.744 | 0.66 | 0.593 |
| 3.571990847131511 | 0.742 | 0.657 | 0.59 |
| 3.575132439785101 | 0.739 | 0.654 | 0.586 |
| 3.578274032438691 | 0.737 | 0.651 | 0.583 |
| 3.58141562509228 | 0.734 | 0.648 | 0.58 |
| 3.58455721774587 | 0.731 | 0.645 | 0.576 |
| 3.58769881039946 | 0.729 | 0.642 | 0.573 |
| 3.590840403053049 | 0.726 | 0.639 | 0.57 |
| 3.593981995706639 | 0.724 | 0.636 | 0.567 |
| 3.597123588360228 | 0.721 | 0.633 | 0.564 |
| 3.600265181013818 | 0.718 | 0.63 | 0.56 |
| 3.603406773667407 | 0.716 | 0.627 | 0.557 |
| 3.606548366320997 | 0.713 | 0.624 | 0.554 |
| 3.609689958974587 | 0.711 | 0.621 | 0.551 |
| 3.612831551628176 | 0.708 | 0.618 | 0.548 |
| 3.615973144281766 | 0.706 | 0.615 | 0.545 |
| 3.619114736935355 | 0.703 | 0.612 | 0.542 |
| 3.622256329588945 | 0.7 | 0.609 | 0.539 |
| 3.625397922242534 | 0.698 | 0.606 | 0.536 |
| 3.628539514896124 | 0.695 | 0.604 | 0.533 |
| 3.631681107549714 | 0.693 | 0.601 | 0.53 |
| 3.634822700203303 | 0.69 | 0.598 | 0.527 |
| 3.637964292856893 | 0.688 | 0.595 | 0.524 |
| 3.641105885510483 | 0.685 | 0.592 | 0.521 |
| 3.644247478164072 | 0.683 | 0.59 | 0.519 |
| 3.647389070817662 | 0.681 | 0.587 | 0.516 |
| 3.650530663471251 | 0.678 | 0.584 | 0.513 |
| 3.653672256124841 | 0.676 | 0.581 | 0.51 |
| 3.656813848778431 | 0.673 | 0.579 | 0.507 |
| 3.65995544143202 | 0.671 | 0.576 | 0.505 |
| 3.66309703408561 | 0.668 | 0.573 | 0.502 |
| 3.666238626739199 | 0.666 | 0.571 | 0.499 |
| 3.66938021939279 | 0.663 | 0.568 | 0.496 |
| 3.672521812046378 | 0.661 | 0.565 | 0.494 |
| 3.675663404699968 | 0.659 | 0.563 | 0.491 |
| 3.678804997353558 | 0.656 | 0.56 | 0.488 |
| 3.681946590007147 | 0.654 | 0.557 | 0.486 |
| 3.685088182660737 | 0.652 | 0.555 | 0.483 |
| 3.688229775314326 | 0.649 | 0.552 | 0.481 |
| 3.691371367967916 | 0.647 | 0.55 | 0.478 |
| 3.694512960621506 | 0.644 | 0.547 | 0.475 |
| 3.697654553275095 | 0.642 | 0.545 | 0.473 |
| 3.700796145928685 | 0.64 | 0.542 | 0.47 |
| 3.703937738582274 | 0.638 | 0.54 | 0.468 |
| 3.707079331235864 | 0.635 | 0.537 | 0.465 |
| 3.710220923889454 | 0.633 | 0.535 | 0.463 |
| 3.713362516543043 | 0.631 | 0.532 | 0.461 |
| 3.716504109196633 | 0.628 | 0.53 | 0.458 |
| 3.719645701850223 | 0.626 | 0.528 | 0.456 |
| 3.722787294503812 | 0.624 | 0.525 | 0.453 |
| 3.725928887157402 | 0.622 | 0.523 | 0.451 |
| 3.729070479810991 | 0.619 | 0.52 | 0.449 |
| 3.732212072464581 | 0.617 | 0.518 | 0.446 |
| 3.735353665118171 | 0.615 | 0.516 | 0.444 |
| 3.73849525777176 | 0.613 | 0.513 | 0.442 |
| 3.74163685042535 | 0.611 | 0.511 | 0.439 |
| 3.744778443078939 | 0.608 | 0.509 | 0.437 |
| 3.747920035732529 | 0.606 | 0.507 | 0.435 |
| 3.751061628386119 | 0.604 | 0.504 | 0.433 |
| 3.754203221039708 | 0.602 | 0.502 | 0.431 |
| 3.757344813693298 | 0.6 | 0.5 | 0.428 |
| 3.760486406346887 | 0.598 | 0.498 | 0.426 |
| 3.763627999000477 | 0.596 | 0.495 | 0.424 |
| 3.766769591654067 | 0.593 | 0.493 | 0.422 |
| 3.769911184307656 | 0.591 | 0.491 | 0.42 |
| 3.773052776961246 | 0.589 | 0.489 | 0.418 |
| 3.776194369614835 | 0.587 | 0.487 | 0.416 |
| 3.779335962268425 | 0.585 | 0.485 | 0.414 |
| 3.782477554922014 | 0.583 | 0.483 | 0.412 |
| 3.785619147575604 | 0.581 | 0.48 | 0.409 |
| 3.788760740229193 | 0.579 | 0.478 | 0.407 |
| 3.791902332882783 | 0.577 | 0.476 | 0.405 |
| 3.795043925536373 | 0.575 | 0.474 | 0.403 |
| 3.798185518189962 | 0.573 | 0.472 | 0.402 |
| 3.801327110843552 | 0.571 | 0.47 | 0.4 |
| 3.804468703497142 | 0.569 | 0.468 | 0.398 |
| 3.807610296150731 | 0.567 | 0.466 | 0.396 |
| 3.810751888804321 | 0.565 | 0.464 | 0.394 |
| 3.813893481457911 | 0.563 | 0.462 | 0.392 |
| 3.8170350741115 | 0.561 | 0.46 | 0.39 |
| 3.82017666676509 | 0.559 | 0.458 | 0.388 |
| 3.823318259418679 | 0.557 | 0.456 | 0.386 |
| 3.826459852072269 | 0.555 | 0.454 | 0.385 |
| 3.829601444725859 | 0.554 | 0.453 | 0.383 |
| 3.832743037379448 | 0.552 | 0.451 | 0.381 |
| 3.835884630033038 | 0.55 | 0.449 | 0.379 |
| 3.839026222686627 | 0.548 | 0.447 | 0.377 |
| 3.842167815340217 | 0.546 | 0.445 | 0.376 |
| 3.845309407993807 | 0.544 | 0.443 | 0.374 |
| 3.848451000647396 | 0.542 | 0.441 | 0.372 |
| 3.851592593300986 | 0.541 | 0.44 | 0.37 |
| 3.854734185954575 | 0.539 | 0.438 | 0.369 |
| 3.857875778608165 | 0.537 | 0.436 | 0.367 |
| 3.861017371261755 | 0.535 | 0.434 | 0.365 |
| 3.864158963915344 | 0.533 | 0.433 | 0.364 |
| 3.867300556568933 | 0.532 | 0.431 | 0.362 |
| 3.870442149222523 | 0.53 | 0.429 | 0.36 |
| 3.873583741876112 | 0.528 | 0.427 | 0.359 |
| 3.876725334529703 | 0.526 | 0.426 | 0.357 |
| 3.879866927183292 | 0.525 | 0.424 | 0.356 |
| 3.883008519836882 | 0.523 | 0.422 | 0.354 |
| 3.886150112490471 | 0.521 | 0.421 | 0.353 |
| 3.889291705144061 | 0.52 | 0.419 | 0.351 |
| 3.892433297797651 | 0.518 | 0.417 | 0.349 |
| 3.89557489045124 | 0.516 | 0.416 | 0.348 |
| 3.89871648310483 | 0.515 | 0.414 | 0.346 |
| 3.901858075758419 | 0.513 | 0.412 | 0.345 |
| 3.904999668412009 | 0.511 | 0.411 | 0.343 |
| 3.908141261065598 | 0.51 | 0.409 | 0.342 |
| 3.911282853719188 | 0.508 | 0.408 | 0.34 |
| 3.914424446372778 | 0.506 | 0.406 | 0.339 |
| 3.917566039026367 | 0.505 | 0.405 | 0.338 |
| 3.920707631679957 | 0.503 | 0.403 | 0.336 |
| 3.923849224333547 | 0.502 | 0.402 | 0.335 |
| 3.926990816987136 | 0.5 | 0.4 | 0.333 |
| 3.930132409640726 | 0.498 | 0.398 | 0.332 |
| 3.933274002294315 | 0.497 | 0.397 | 0.331 |
| 3.936415594947905 | 0.495 | 0.396 | 0.329 |
| 3.939557187601495 | 0.494 | 0.394 | 0.328 |
| 3.942698780255084 | 0.492 | 0.393 | 0.326 |
| 3.945840372908674 | 0.491 | 0.391 | 0.325 |
| 3.948981965562263 | 0.489 | 0.39 | 0.324 |
| 3.952123558215853 | 0.488 | 0.388 | 0.323 |
| 3.955265150869442 | 0.486 | 0.387 | 0.321 |
| 3.958406743523032 | 0.485 | 0.385 | 0.32 |
| 3.961548336176622 | 0.483 | 0.384 | 0.319 |
| 3.964689928830211 | 0.482 | 0.383 | 0.317 |
| 3.967831521483801 | 0.48 | 0.381 | 0.316 |
| 3.97097311413739 | 0.479 | 0.38 | 0.315 |
| 3.97411470679098 | 0.478 | 0.379 | 0.314 |
| 3.97725629944457 | 0.476 | 0.377 | 0.312 |
| 3.98039789209816 | 0.475 | 0.376 | 0.311 |
| 3.983539484751749 | 0.473 | 0.375 | 0.31 |
| 3.986681077405338 | 0.472 | 0.373 | 0.309 |
| 3.989822670058928 | 0.471 | 0.372 | 0.308 |
| 3.992964262712517 | 0.469 | 0.371 | 0.306 |
| 3.996105855366107 | 0.468 | 0.369 | 0.305 |
| 3.999247448019697 | 0.466 | 0.368 | 0.304 |
| 4.002389040673287 | 0.465 | 0.367 | 0.303 |
| 4.005530633326877 | 0.464 | 0.366 | 0.302 |
| 4.008672225980466 | 0.462 | 0.364 | 0.301 |
| 4.011813818634056 | 0.461 | 0.363 | 0.3 |
| 4.014955411287645 | 0.46 | 0.362 | 0.299 |
| 4.018097003941234 | 0.458 | 0.361 | 0.297 |
| 4.021238596594824 | 0.457 | 0.36 | 0.296 |
| 4.024380189248414 | 0.456 | 0.358 | 0.295 |
| 4.027521781902004 | 0.455 | 0.357 | 0.294 |
| 4.030663374555593 | 0.453 | 0.356 | 0.293 |
| 4.033804967209183 | 0.452 | 0.355 | 0.292 |
| 4.036946559862773 | 0.451 | 0.354 | 0.291 |
| 4.040088152516362 | 0.45 | 0.353 | 0.29 |
| 4.043229745169951 | 0.448 | 0.351 | 0.289 |
| 4.046371337823541 | 0.447 | 0.35 | 0.288 |
| 4.049512930477131 | 0.446 | 0.349 | 0.287 |
| 4.05265452313072 | 0.445 | 0.348 | 0.286 |
| 4.05579611578431 | 0.444 | 0.347 | 0.285 |
| 4.0589377084379 | 0.442 | 0.346 | 0.284 |
| 4.062079301091489 | 0.441 | 0.345 | 0.283 |
| 4.065220893745079 | 0.44 | 0.344 | 0.282 |
| 4.068362486398668 | 0.439 | 0.343 | 0.281 |
| 4.071504079052258 | 0.438 | 0.342 | 0.28 |
| 4.074645671705848 | 0.436 | 0.341 | 0.279 |
| 4.077787264359437 | 0.435 | 0.339 | 0.278 |
| 4.080928857013027 | 0.434 | 0.338 | 0.277 |
| 4.084070449666616 | 0.433 | 0.337 | 0.276 |
| 4.087212042320206 | 0.432 | 0.336 | 0.275 |
| 4.090353634973795 | 0.431 | 0.335 | 0.275 |
| 4.093495227627385 | 0.43 | 0.334 | 0.274 |
| 4.096636820280975 | 0.429 | 0.333 | 0.273 |
| 4.099778412934564 | 0.428 | 0.332 | 0.272 |
| 4.102920005588154 | 0.427 | 0.331 | 0.271 |
| 4.106061598241744 | 0.425 | 0.33 | 0.27 |
| 4.109203190895333 | 0.424 | 0.33 | 0.269 |
| 4.112344783548923 | 0.423 | 0.329 | 0.268 |
| 4.115486376202512 | 0.422 | 0.328 | 0.268 |
| 4.118627968856102 | 0.421 | 0.327 | 0.267 |
| 4.121769561509692 | 0.42 | 0.326 | 0.266 |
| 4.124911154163281 | 0.419 | 0.325 | 0.265 |
| 4.128052746816871 | 0.418 | 0.324 | 0.264 |
| 4.13119433947046 | 0.417 | 0.323 | 0.264 |
| 4.13433593212405 | 0.416 | 0.322 | 0.263 |
| 4.13747752477764 | 0.415 | 0.321 | 0.262 |
| 4.14061911743123 | 0.414 | 0.32 | 0.261 |
| 4.143760710084818 | 0.413 | 0.319 | 0.26 |
| 4.146902302738408 | 0.412 | 0.319 | 0.26 |
| 4.150043895391998 | 0.411 | 0.318 | 0.259 |
| 4.153185488045588 | 0.41 | 0.317 | 0.258 |
| 4.156327080699177 | 0.409 | 0.316 | 0.257 |
| 4.159468673352766 | 0.408 | 0.315 | 0.257 |
| 4.162610266006356 | 0.407 | 0.314 | 0.256 |
| 4.165751858659946 | 0.407 | 0.314 | 0.255 |
| 4.168893451313535 | 0.406 | 0.313 | 0.254 |
| 4.172035043967125 | 0.405 | 0.312 | 0.254 |
| 4.175176636620715 | 0.404 | 0.311 | 0.253 |
| 4.178318229274304 | 0.403 | 0.31 | 0.252 |
| 4.181459821927894 | 0.402 | 0.31 | 0.252 |
| 4.184601414581484 | 0.401 | 0.309 | 0.251 |
| 4.187743007235073 | 0.4 | 0.308 | 0.25 |
| 4.190884599888663 | 0.399 | 0.307 | 0.25 |
| 4.194026192542252 | 0.399 | 0.306 | 0.249 |
| 4.197167785195842 | 0.398 | 0.306 | 0.248 |
| 4.200309377849432 | 0.397 | 0.305 | 0.248 |
| 4.203450970503021 | 0.396 | 0.304 | 0.247 |
| 4.206592563156611 | 0.395 | 0.303 | 0.246 |
| 4.2097341558102 | 0.394 | 0.303 | 0.246 |
| 4.21287574846379 | 0.394 | 0.302 | 0.245 |
| 4.21601734111738 | 0.393 | 0.301 | 0.244 |
| 4.21915893377097 | 0.392 | 0.301 | 0.244 |
| 4.222300526424559 | 0.391 | 0.3 | 0.243 |
| 4.225442119078148 | 0.39 | 0.299 | 0.242 |
| 4.228583711731738 | 0.39 | 0.298 | 0.242 |
| 4.231725304385327 | 0.389 | 0.298 | 0.241 |
| 4.234866897038917 | 0.388 | 0.297 | 0.241 |
| 4.238008489692506 | 0.387 | 0.296 | 0.24 |
| 4.241150082346096 | 0.386 | 0.296 | 0.239 |
| 4.244291674999685 | 0.386 | 0.295 | 0.239 |
| 4.247433267653276 | 0.385 | 0.294 | 0.238 |
| 4.250574860306865 | 0.384 | 0.294 | 0.238 |
| 4.253716452960455 | 0.383 | 0.293 | 0.237 |
| 4.256858045614044 | 0.383 | 0.292 | 0.237 |
| 4.259999638267634 | 0.382 | 0.292 | 0.236 |
| 4.263141230921224 | 0.381 | 0.291 | 0.236 |
| 4.266282823574813 | 0.381 | 0.291 | 0.235 |
| 4.269424416228403 | 0.38 | 0.29 | 0.234 |
| 4.272566008881992 | 0.379 | 0.289 | 0.234 |
| 4.275707601535582 | 0.378 | 0.289 | 0.233 |
| 4.27884919418917 | 0.378 | 0.288 | 0.233 |
| 4.28199078684276 | 0.377 | 0.288 | 0.232 |
| 4.285132379496351 | 0.376 | 0.287 | 0.232 |
| 4.28827397214994 | 0.376 | 0.286 | 0.231 |
| 4.29141556480353 | 0.375 | 0.286 | 0.231 |
| 4.294557157457119 | 0.374 | 0.285 | 0.23 |
| 4.29769875011071 | 0.374 | 0.285 | 0.23 |
| 4.300840342764299 | 0.373 | 0.284 | 0.229 |
| 4.303981935417888 | 0.373 | 0.284 | 0.229 |
| 4.307123528071478 | 0.372 | 0.283 | 0.228 |
| 4.310265120725067 | 0.371 | 0.282 | 0.228 |
| 4.313406713378657 | 0.371 | 0.282 | 0.227 |
| 4.316548306032247 | 0.37 | 0.281 | 0.227 |
| 4.319689898685836 | 0.369 | 0.281 | 0.227 |
| 4.322831491339426 | 0.369 | 0.28 | 0.226 |
| 4.325973083993015 | 0.368 | 0.28 | 0.226 |
| 4.329114676646605 | 0.368 | 0.279 | 0.225 |
| 4.332256269300195 | 0.367 | 0.279 | 0.225 |
| 4.335397861953784 | 0.366 | 0.278 | 0.224 |
| 4.338539454607374 | 0.366 | 0.278 | 0.224 |
| 4.341681047260963 | 0.365 | 0.277 | 0.223 |
| 4.344822639914553 | 0.365 | 0.277 | 0.223 |
| 4.347964232568143 | 0.364 | 0.276 | 0.223 |
| 4.351105825221732 | 0.364 | 0.276 | 0.222 |
| 4.354247417875322 | 0.363 | 0.275 | 0.222 |
| 4.357389010528911 | 0.363 | 0.275 | 0.221 |
| 4.360530603182501 | 0.362 | 0.274 | 0.221 |
| 4.36367219583609 | 0.361 | 0.274 | 0.221 |
| 4.36681378848968 | 0.361 | 0.274 | 0.22 |
| 4.36995538114327 | 0.36 | 0.273 | 0.22 |
| 4.373096973796859 | 0.36 | 0.273 | 0.219 |
| 4.376238566450449 | 0.359 | 0.272 | 0.219 |
| 4.379380159104038 | 0.359 | 0.272 | 0.219 |
| 4.382521751757628 | 0.358 | 0.271 | 0.218 |
| 4.385663344411217 | 0.358 | 0.271 | 0.218 |
| 4.388804937064807 | 0.357 | 0.271 | 0.218 |
| 4.391946529718397 | 0.357 | 0.27 | 0.217 |
| 4.395088122371987 | 0.356 | 0.27 | 0.217 |
| 4.398229715025576 | 0.356 | 0.269 | 0.217 |
| 4.401371307679165 | 0.356 | 0.269 | 0.216 |
| 4.404512900332755 | 0.355 | 0.268 | 0.216 |
| 4.407654492986345 | 0.355 | 0.268 | 0.216 |
| 4.410796085639934 | 0.354 | 0.268 | 0.215 |
| 4.413937678293524 | 0.354 | 0.267 | 0.215 |
| 4.417079270947114 | 0.353 | 0.267 | 0.215 |
| 4.420220863600703 | 0.353 | 0.267 | 0.214 |
| 4.423362456254293 | 0.352 | 0.266 | 0.214 |
| 4.426504048907883 | 0.352 | 0.266 | 0.214 |
| 4.429645641561472 | 0.352 | 0.265 | 0.213 |
| 4.432787234215062 | 0.351 | 0.265 | 0.213 |
| 4.435928826868651 | 0.351 | 0.265 | 0.213 |
| 4.43907041952224 | 0.35 | 0.264 | 0.212 |
| 4.44221201217583 | 0.35 | 0.264 | 0.212 |
| 4.44535360482942 | 0.35 | 0.264 | 0.212 |
| 4.44849519748301 | 0.349 | 0.263 | 0.212 |
| 4.4516367901366 | 0.349 | 0.263 | 0.211 |
| 4.454778382790188 | 0.348 | 0.263 | 0.211 |
| 4.457919975443779 | 0.348 | 0.262 | 0.211 |
| 4.461061568097368 | 0.348 | 0.262 | 0.21 |
| 4.464203160750958 | 0.347 | 0.262 | 0.21 |
| 4.467344753404547 | 0.347 | 0.262 | 0.21 |
| 4.470486346058137 | 0.347 | 0.261 | 0.21 |
| 4.473627938711726 | 0.346 | 0.261 | 0.209 |
| 4.476769531365316 | 0.346 | 0.261 | 0.209 |
| 4.479911124018905 | 0.346 | 0.26 | 0.209 |
| 4.483052716672495 | 0.345 | 0.26 | 0.209 |
| 4.486194309326085 | 0.345 | 0.26 | 0.208 |
| 4.489335901979674 | 0.345 | 0.26 | 0.208 |
| 4.492477494633264 | 0.344 | 0.259 | 0.208 |
| 4.495619087286854 | 0.344 | 0.259 | 0.208 |
| 4.498760679940443 | 0.344 | 0.259 | 0.207 |
| 4.501902272594033 | 0.343 | 0.258 | 0.207 |
| 4.505043865247622 | 0.343 | 0.258 | 0.207 |
| 4.508185457901212 | 0.343 | 0.258 | 0.207 |
| 4.511327050554801 | 0.342 | 0.258 | 0.207 |
| 4.514468643208391 | 0.342 | 0.257 | 0.206 |
| 4.517610235861981 | 0.342 | 0.257 | 0.206 |
| 4.520751828515571 | 0.342 | 0.257 | 0.206 |
| 4.52389342116916 | 0.341 | 0.257 | 0.206 |
| 4.52703501382275 | 0.341 | 0.257 | 0.206 |
| 4.530176606476339 | 0.341 | 0.256 | 0.205 |
| 4.533318199129928 | 0.341 | 0.256 | 0.205 |
| 4.536459791783518 | 0.34 | 0.256 | 0.205 |
| 4.539601384437108 | 0.34 | 0.256 | 0.205 |
| 4.542742977090698 | 0.34 | 0.255 | 0.205 |
| 4.545884569744287 | 0.34 | 0.255 | 0.204 |
| 4.549026162397876 | 0.339 | 0.255 | 0.204 |
| 4.552167755051466 | 0.339 | 0.255 | 0.204 |
| 4.555309347705056 | 0.339 | 0.255 | 0.204 |
| 4.558450940358646 | 0.339 | 0.254 | 0.204 |
| 4.561592533012235 | 0.338 | 0.254 | 0.204 |
| 4.564734125665825 | 0.338 | 0.254 | 0.204 |
| 4.567875718319415 | 0.338 | 0.254 | 0.203 |
| 4.571017310973004 | 0.338 | 0.254 | 0.203 |
| 4.574158903626594 | 0.338 | 0.254 | 0.203 |
| 4.577300496280183 | 0.337 | 0.253 | 0.203 |
| 4.580442088933772 | 0.337 | 0.253 | 0.203 |
| 4.583583681587362 | 0.337 | 0.253 | 0.203 |
| 4.586725274240952 | 0.337 | 0.253 | 0.203 |
| 4.589866866894542 | 0.337 | 0.253 | 0.202 |
| 4.593008459548131 | 0.337 | 0.253 | 0.202 |
| 4.596150052201721 | 0.336 | 0.253 | 0.202 |
| 4.59929164485531 | 0.336 | 0.252 | 0.202 |
| 4.6024332375089 | 0.336 | 0.252 | 0.202 |
| 4.60557483016249 | 0.336 | 0.252 | 0.202 |
| 4.608716422816079 | 0.336 | 0.252 | 0.202 |
| 4.611858015469668 | 0.336 | 0.252 | 0.202 |
| 4.614999608123258 | 0.335 | 0.252 | 0.202 |
| 4.618141200776848 | 0.335 | 0.252 | 0.201 |
| 4.621282793430437 | 0.335 | 0.252 | 0.201 |
| 4.624424386084027 | 0.335 | 0.251 | 0.201 |
| 4.627565978737617 | 0.335 | 0.251 | 0.201 |
| 4.630707571391206 | 0.335 | 0.251 | 0.201 |
| 4.633849164044795 | 0.335 | 0.251 | 0.201 |
| 4.636990756698386 | 0.335 | 0.251 | 0.201 |
| 4.640132349351975 | 0.334 | 0.251 | 0.201 |
| 4.643273942005564 | 0.334 | 0.251 | 0.201 |
| 4.646415534659154 | 0.334 | 0.251 | 0.201 |
| 4.649557127312744 | 0.334 | 0.251 | 0.201 |
| 4.652698719966334 | 0.334 | 0.251 | 0.201 |
| 4.655840312619923 | 0.334 | 0.251 | 0.201 |
| 4.658981905273513 | 0.334 | 0.251 | 0.2 |
| 4.662123497927102 | 0.334 | 0.25 | 0.2 |
| 4.665265090580692 | 0.334 | 0.25 | 0.2 |
| 4.668406683234282 | 0.334 | 0.25 | 0.2 |
| 4.671548275887871 | 0.334 | 0.25 | 0.2 |
| 4.674689868541461 | 0.334 | 0.25 | 0.2 |
| 4.67783146119505 | 0.334 | 0.25 | 0.2 |
| 4.68097305384864 | 0.334 | 0.25 | 0.2 |
| 4.68411464650223 | 0.334 | 0.25 | 0.2 |
| 4.687256239155819 | 0.333 | 0.25 | 0.2 |
| 4.690397831809409 | 0.333 | 0.25 | 0.2 |
| 4.693539424462998 | 0.333 | 0.25 | 0.2 |
| 4.696681017116588 | 0.333 | 0.25 | 0.2 |
| 4.699822609770177 | 0.333 | 0.25 | 0.2 |
| 4.702964202423767 | 0.333 | 0.25 | 0.2 |
| 4.706105795077356 | 0.333 | 0.25 | 0.2 |
| 4.709247387730946 | 0.333 | 0.25 | 0.2 |
| 4.712388980384535 | 0.333 | 0.25 | 0.2 |
| 4.715530573038126 | 0.333 | 0.25 | 0.2 |
| 4.718672165691715 | 0.333 | 0.25 | 0.2 |
| 4.721813758345305 | 0.333 | 0.25 | 0.2 |
| 4.724955350998894 | 0.333 | 0.25 | 0.2 |
| 4.728096943652484 | 0.333 | 0.25 | 0.2 |
| 4.731238536306074 | 0.333 | 0.25 | 0.2 |
| 4.734380128959663 | 0.333 | 0.25 | 0.2 |
| 4.737521721613253 | 0.333 | 0.25 | 0.2 |
| 4.740663314266842 | 0.334 | 0.25 | 0.2 |
| 4.743804906920432 | 0.334 | 0.25 | 0.2 |
| 4.74694649957402 | 0.334 | 0.25 | 0.2 |
| 4.750088092227611 | 0.334 | 0.25 | 0.2 |
| 4.7532296848812 | 0.334 | 0.25 | 0.2 |
| 4.75637127753479 | 0.334 | 0.25 | 0.2 |
| 4.75951287018838 | 0.334 | 0.25 | 0.2 |
| 4.76265446284197 | 0.334 | 0.25 | 0.2 |
| 4.765796055495559 | 0.334 | 0.251 | 0.2 |
| 4.768937648149149 | 0.334 | 0.251 | 0.201 |
| 4.772079240802738 | 0.334 | 0.251 | 0.201 |
| 4.775220833456327 | 0.334 | 0.251 | 0.201 |
| 4.778362426109917 | 0.334 | 0.251 | 0.201 |
| 4.781504018763507 | 0.334 | 0.251 | 0.201 |
| 4.784645611417097 | 0.334 | 0.251 | 0.201 |
| 4.787787204070686 | 0.335 | 0.251 | 0.201 |
| 4.790928796724275 | 0.335 | 0.251 | 0.201 |
| 4.794070389377865 | 0.335 | 0.251 | 0.201 |
| 4.797211982031455 | 0.335 | 0.251 | 0.201 |
| 4.800353574685045 | 0.335 | 0.251 | 0.201 |
| 4.803495167338634 | 0.335 | 0.252 | 0.201 |
| 4.806636759992224 | 0.335 | 0.252 | 0.201 |
| 4.809778352645814 | 0.335 | 0.252 | 0.202 |
| 4.812919945299403 | 0.336 | 0.252 | 0.202 |
| 4.816061537952993 | 0.336 | 0.252 | 0.202 |
| 4.819203130606582 | 0.336 | 0.252 | 0.202 |
| 4.822344723260172 | 0.336 | 0.252 | 0.202 |
| 4.825486315913761 | 0.336 | 0.252 | 0.202 |
| 4.828627908567351 | 0.336 | 0.253 | 0.202 |
| 4.83176950122094 | 0.337 | 0.253 | 0.202 |
| 4.83491109387453 | 0.337 | 0.253 | 0.202 |
| 4.83805268652812 | 0.337 | 0.253 | 0.203 |
| 4.841194279181709 | 0.337 | 0.253 | 0.203 |
| 4.844335871835299 | 0.337 | 0.253 | 0.203 |
| 4.847477464488889 | 0.337 | 0.253 | 0.203 |
| 4.850619057142478 | 0.338 | 0.254 | 0.203 |
| 4.853760649796068 | 0.338 | 0.254 | 0.203 |
| 4.856902242449657 | 0.338 | 0.254 | 0.203 |
| 4.860043835103247 | 0.338 | 0.254 | 0.204 |
| 4.863185427756837 | 0.338 | 0.254 | 0.204 |
| 4.866327020410426 | 0.339 | 0.254 | 0.204 |
| 4.869468613064015 | 0.339 | 0.255 | 0.204 |
| 4.872610205717605 | 0.339 | 0.255 | 0.204 |
| 4.875751798371195 | 0.339 | 0.255 | 0.204 |
| 4.878893391024784 | 0.34 | 0.255 | 0.204 |
| 4.882034983678374 | 0.34 | 0.255 | 0.205 |
| 4.885176576331964 | 0.34 | 0.256 | 0.205 |
| 4.888318168985553 | 0.34 | 0.256 | 0.205 |
| 4.891459761639143 | 0.341 | 0.256 | 0.205 |
| 4.894601354292733 | 0.341 | 0.256 | 0.205 |
| 4.897742946946322 | 0.341 | 0.257 | 0.206 |
| 4.900884539599912 | 0.341 | 0.257 | 0.206 |
| 4.904026132253501 | 0.342 | 0.257 | 0.206 |
| 4.907167724907091 | 0.342 | 0.257 | 0.206 |
| 4.91030931756068 | 0.342 | 0.257 | 0.206 |
| 4.91345091021427 | 0.342 | 0.258 | 0.207 |
| 4.91659250286786 | 0.343 | 0.258 | 0.207 |
| 4.91973409552145 | 0.343 | 0.258 | 0.207 |
| 4.922875688175039 | 0.343 | 0.258 | 0.207 |
| 4.926017280828628 | 0.344 | 0.259 | 0.207 |
| 4.929158873482218 | 0.344 | 0.259 | 0.208 |
| 4.932300466135808 | 0.344 | 0.259 | 0.208 |
| 4.935442058789397 | 0.345 | 0.26 | 0.208 |
| 4.938583651442987 | 0.345 | 0.26 | 0.208 |
| 4.941725244096576 | 0.345 | 0.26 | 0.209 |
| 4.944866836750166 | 0.346 | 0.26 | 0.209 |
| 4.948008429403755 | 0.346 | 0.261 | 0.209 |
| 4.951150022057345 | 0.346 | 0.261 | 0.209 |
| 4.954291614710935 | 0.347 | 0.261 | 0.21 |
| 4.957433207364524 | 0.347 | 0.262 | 0.21 |
| 4.960574800018114 | 0.347 | 0.262 | 0.21 |
| 4.963716392671704 | 0.348 | 0.262 | 0.21 |
| 4.966857985325293 | 0.348 | 0.262 | 0.211 |
| 4.969999577978883 | 0.348 | 0.263 | 0.211 |
| 4.973141170632472 | 0.349 | 0.263 | 0.211 |
| 4.976282763286062 | 0.349 | 0.263 | 0.212 |
| 4.979424355939651 | 0.35 | 0.264 | 0.212 |
| 4.982565948593241 | 0.35 | 0.264 | 0.212 |
| 4.985707541246831 | 0.35 | 0.264 | 0.212 |
| 4.98884913390042 | 0.351 | 0.265 | 0.213 |
| 4.99199072655401 | 0.351 | 0.265 | 0.213 |
| 4.9951323192076 | 0.352 | 0.265 | 0.213 |
| 4.99827391186119 | 0.352 | 0.266 | 0.214 |
| 5.00141550451478 | 0.352 | 0.266 | 0.214 |
| 5.004557097168369 | 0.353 | 0.267 | 0.214 |
| 5.007698689821958 | 0.353 | 0.267 | 0.215 |
| 5.010840282475548 | 0.354 | 0.267 | 0.215 |
| 5.013981875129137 | 0.354 | 0.268 | 0.215 |
| 5.017123467782727 | 0.355 | 0.268 | 0.216 |
| 5.020265060436317 | 0.355 | 0.268 | 0.216 |
| 5.023406653089906 | 0.356 | 0.269 | 0.216 |
| 5.026548245743496 | 0.356 | 0.269 | 0.217 |
| 5.029689838397085 | 0.356 | 0.27 | 0.217 |
| 5.032831431050674 | 0.357 | 0.27 | 0.217 |
| 5.035973023704264 | 0.357 | 0.271 | 0.218 |
| 5.039114616357854 | 0.358 | 0.271 | 0.218 |
| 5.042256209011444 | 0.358 | 0.271 | 0.218 |
| 5.045397801665033 | 0.359 | 0.272 | 0.219 |
| 5.048539394318622 | 0.359 | 0.272 | 0.219 |
| 5.051680986972213 | 0.36 | 0.273 | 0.219 |
| 5.054822579625802 | 0.36 | 0.273 | 0.22 |
| 5.057964172279392 | 0.361 | 0.274 | 0.22 |
| 5.061105764932981 | 0.361 | 0.274 | 0.221 |
| 5.064247357586571 | 0.362 | 0.274 | 0.221 |
| 5.067388950240161 | 0.363 | 0.275 | 0.221 |
| 5.07053054289375 | 0.363 | 0.275 | 0.222 |
| 5.07367213554734 | 0.364 | 0.276 | 0.222 |
| 5.07681372820093 | 0.364 | 0.276 | 0.223 |
| 5.079955320854519 | 0.365 | 0.277 | 0.223 |
| 5.083096913508108 | 0.365 | 0.277 | 0.223 |
| 5.086238506161698 | 0.366 | 0.278 | 0.224 |
| 5.089380098815288 | 0.366 | 0.278 | 0.224 |
| 5.092521691468877 | 0.367 | 0.279 | 0.225 |
| 5.095663284122466 | 0.368 | 0.279 | 0.225 |
| 5.098804876776057 | 0.368 | 0.28 | 0.226 |
| 5.101946469429646 | 0.369 | 0.28 | 0.226 |
| 5.105088062083236 | 0.369 | 0.281 | 0.227 |
| 5.108229654736825 | 0.37 | 0.281 | 0.227 |
| 5.111371247390415 | 0.371 | 0.282 | 0.227 |
| 5.114512840044005 | 0.371 | 0.282 | 0.228 |
| 5.117654432697594 | 0.372 | 0.283 | 0.228 |
| 5.120796025351184 | 0.373 | 0.284 | 0.229 |
| 5.123937618004773 | 0.373 | 0.284 | 0.229 |
| 5.127079210658363 | 0.374 | 0.285 | 0.23 |
| 5.130220803311953 | 0.374 | 0.285 | 0.23 |
| 5.133362395965542 | 0.375 | 0.286 | 0.231 |
| 5.136503988619131 | 0.376 | 0.286 | 0.231 |
| 5.13964558127272 | 0.376 | 0.287 | 0.232 |
| 5.142787173926311 | 0.377 | 0.288 | 0.232 |
| 5.1459287665799 | 0.378 | 0.288 | 0.233 |
| 5.14907035923349 | 0.378 | 0.289 | 0.233 |
| 5.15221195188708 | 0.379 | 0.289 | 0.234 |
| 5.15535354454067 | 0.38 | 0.29 | 0.234 |
| 5.158495137194259 | 0.381 | 0.291 | 0.235 |
| 5.161636729847848 | 0.381 | 0.291 | 0.236 |
| 5.164778322501438 | 0.382 | 0.292 | 0.236 |
| 5.167919915155028 | 0.383 | 0.292 | 0.237 |
| 5.171061507808617 | 0.383 | 0.293 | 0.237 |
| 5.174203100462206 | 0.384 | 0.294 | 0.238 |
| 5.177344693115796 | 0.385 | 0.294 | 0.238 |
| 5.180486285769386 | 0.386 | 0.295 | 0.239 |
| 5.183627878422976 | 0.386 | 0.296 | 0.239 |
| 5.186769471076565 | 0.387 | 0.296 | 0.24 |
| 5.189911063730155 | 0.388 | 0.297 | 0.241 |
| 5.193052656383744 | 0.389 | 0.298 | 0.241 |
| 5.196194249037334 | 0.39 | 0.298 | 0.242 |
| 5.199335841690924 | 0.39 | 0.299 | 0.242 |
| 5.202477434344513 | 0.391 | 0.3 | 0.243 |
| 5.205619026998103 | 0.392 | 0.301 | 0.244 |
| 5.208760619651692 | 0.393 | 0.301 | 0.244 |
| 5.211902212305282 | 0.394 | 0.302 | 0.245 |
| 5.215043804958871 | 0.394 | 0.303 | 0.246 |
| 5.218185397612461 | 0.395 | 0.303 | 0.246 |
| 5.221326990266051 | 0.396 | 0.304 | 0.247 |
| 5.22446858291964 | 0.397 | 0.305 | 0.248 |
| 5.22761017557323 | 0.398 | 0.306 | 0.248 |
| 5.23075176822682 | 0.399 | 0.306 | 0.249 |
| 5.23389336088041 | 0.399 | 0.307 | 0.25 |
| 5.237034953533999 | 0.4 | 0.308 | 0.25 |
| 5.240176546187588 | 0.401 | 0.309 | 0.251 |
| 5.243318138841178 | 0.402 | 0.31 | 0.252 |
| 5.246459731494767 | 0.403 | 0.31 | 0.252 |
| 5.249601324148357 | 0.404 | 0.311 | 0.253 |
| 5.252742916801947 | 0.405 | 0.312 | 0.254 |
| 5.255884509455536 | 0.406 | 0.313 | 0.254 |
| 5.259026102109125 | 0.407 | 0.314 | 0.255 |
| 5.262167694762715 | 0.407 | 0.314 | 0.256 |
| 5.265309287416305 | 0.408 | 0.315 | 0.257 |
| 5.268450880069895 | 0.409 | 0.316 | 0.257 |
| 5.271592472723484 | 0.41 | 0.317 | 0.258 |
| 5.274734065377074 | 0.411 | 0.318 | 0.259 |
| 5.277875658030664 | 0.412 | 0.319 | 0.26 |
| 5.281017250684253 | 0.413 | 0.319 | 0.26 |
| 5.284158843337843 | 0.414 | 0.32 | 0.261 |
| 5.287300435991432 | 0.415 | 0.321 | 0.262 |
| 5.290442028645022 | 0.416 | 0.322 | 0.263 |
| 5.293583621298612 | 0.417 | 0.323 | 0.264 |
| 5.296725213952201 | 0.418 | 0.324 | 0.264 |
| 5.299866806605791 | 0.419 | 0.325 | 0.265 |
| 5.30300839925938 | 0.42 | 0.326 | 0.266 |
| 5.30614999191297 | 0.421 | 0.327 | 0.267 |
| 5.30929158456656 | 0.422 | 0.328 | 0.268 |
| 5.312433177220149 | 0.423 | 0.329 | 0.268 |
| 5.315574769873739 | 0.424 | 0.33 | 0.269 |
| 5.318716362527328 | 0.425 | 0.33 | 0.27 |
| 5.321857955180918 | 0.427 | 0.331 | 0.271 |
| 5.324999547834508 | 0.428 | 0.332 | 0.272 |
| 5.328141140488097 | 0.429 | 0.333 | 0.273 |
| 5.331282733141686 | 0.43 | 0.334 | 0.274 |
| 5.334424325795276 | 0.431 | 0.335 | 0.275 |
| 5.337565918448866 | 0.432 | 0.336 | 0.275 |
| 5.340707511102456 | 0.433 | 0.337 | 0.276 |
| 5.343849103756045 | 0.434 | 0.338 | 0.277 |
| 5.346990696409634 | 0.435 | 0.339 | 0.278 |
| 5.350132289063224 | 0.436 | 0.341 | 0.279 |
| 5.353273881716814 | 0.438 | 0.342 | 0.28 |
| 5.356415474370403 | 0.439 | 0.343 | 0.281 |
| 5.359557067023993 | 0.44 | 0.344 | 0.282 |
| 5.362698659677583 | 0.441 | 0.345 | 0.283 |
| 5.365840252331172 | 0.442 | 0.346 | 0.284 |
| 5.368981844984762 | 0.444 | 0.347 | 0.285 |
| 5.372123437638351 | 0.445 | 0.348 | 0.286 |
| 5.375265030291941 | 0.446 | 0.349 | 0.287 |
| 5.378406622945531 | 0.447 | 0.35 | 0.288 |
| 5.38154821559912 | 0.448 | 0.351 | 0.289 |
| 5.38468980825271 | 0.45 | 0.353 | 0.29 |
| 5.387831400906299 | 0.451 | 0.354 | 0.291 |
| 5.39097299355989 | 0.452 | 0.355 | 0.292 |
| 5.394114586213479 | 0.453 | 0.356 | 0.293 |
| 5.397256178867068 | 0.455 | 0.357 | 0.294 |
| 5.400397771520657 | 0.456 | 0.358 | 0.295 |
| 5.403539364174247 | 0.457 | 0.36 | 0.296 |
| 5.406680956827837 | 0.458 | 0.361 | 0.297 |
| 5.409822549481426 | 0.46 | 0.362 | 0.299 |
| 5.412964142135016 | 0.461 | 0.363 | 0.3 |
| 5.416105734788605 | 0.462 | 0.364 | 0.301 |
| 5.419247327442195 | 0.464 | 0.366 | 0.302 |
| 5.422388920095785 | 0.465 | 0.367 | 0.303 |
| 5.425530512749375 | 0.466 | 0.368 | 0.304 |
| 5.428672105402964 | 0.468 | 0.369 | 0.305 |
| 5.431813698056554 | 0.469 | 0.371 | 0.306 |
| 5.434955290710143 | 0.471 | 0.372 | 0.308 |
| 5.438096883363733 | 0.472 | 0.373 | 0.309 |
| 5.441238476017322 | 0.473 | 0.375 | 0.31 |
| 5.444380068670912 | 0.475 | 0.376 | 0.311 |
| 5.447521661324502 | 0.476 | 0.377 | 0.312 |
| 5.450663253978091 | 0.478 | 0.379 | 0.314 |
| 5.453804846631681 | 0.479 | 0.38 | 0.315 |
| 5.456946439285271 | 0.48 | 0.381 | 0.316 |
| 5.46008803193886 | 0.482 | 0.383 | 0.317 |
| 5.46322962459245 | 0.483 | 0.384 | 0.319 |
| 5.466371217246039 | 0.485 | 0.385 | 0.32 |
| 5.46951280989963 | 0.486 | 0.387 | 0.321 |
| 5.472654402553218 | 0.488 | 0.388 | 0.323 |
| 5.475795995206808 | 0.489 | 0.39 | 0.324 |
| 5.478937587860398 | 0.491 | 0.391 | 0.325 |
| 5.482079180513987 | 0.492 | 0.393 | 0.326 |
| 5.485220773167577 | 0.494 | 0.394 | 0.328 |
| 5.488362365821166 | 0.495 | 0.396 | 0.329 |
| 5.491503958474756 | 0.497 | 0.397 | 0.331 |
| 5.494645551128346 | 0.498 | 0.398 | 0.332 |
| 5.497787143781935 | 0.5 | 0.4 | 0.333 |
| 5.500928736435525 | 0.502 | 0.402 | 0.335 |
| 5.504070329089115 | 0.503 | 0.403 | 0.336 |
| 5.507211921742704 | 0.505 | 0.405 | 0.338 |
| 5.510353514396294 | 0.506 | 0.406 | 0.339 |
| 5.513495107049883 | 0.508 | 0.408 | 0.34 |
| 5.516636699703473 | 0.51 | 0.409 | 0.342 |
| 5.519778292357062 | 0.511 | 0.411 | 0.343 |
| 5.522919885010652 | 0.513 | 0.412 | 0.345 |
| 5.526061477664242 | 0.515 | 0.414 | 0.346 |
| 5.529203070317831 | 0.516 | 0.416 | 0.348 |
| 5.532344662971421 | 0.518 | 0.417 | 0.349 |
| 5.535486255625011 | 0.52 | 0.419 | 0.351 |
| 5.5386278482786 | 0.521 | 0.421 | 0.353 |
| 5.54176944093219 | 0.523 | 0.422 | 0.354 |
| 5.544911033585779 | 0.525 | 0.424 | 0.356 |
| 5.54805262623937 | 0.526 | 0.426 | 0.357 |
| 5.551194218892959 | 0.528 | 0.427 | 0.359 |
| 5.554335811546548 | 0.53 | 0.429 | 0.36 |
| 5.557477404200137 | 0.532 | 0.431 | 0.362 |
| 5.560618996853727 | 0.533 | 0.433 | 0.364 |
| 5.563760589507317 | 0.535 | 0.434 | 0.365 |
| 5.566902182160906 | 0.537 | 0.436 | 0.367 |
| 5.570043774814496 | 0.539 | 0.438 | 0.369 |
| 5.573185367468086 | 0.541 | 0.44 | 0.37 |
| 5.576326960121675 | 0.542 | 0.441 | 0.372 |
| 5.579468552775264 | 0.544 | 0.443 | 0.374 |
| 5.582610145428854 | 0.546 | 0.445 | 0.376 |
| 5.585751738082444 | 0.548 | 0.447 | 0.377 |
| 5.588893330736034 | 0.55 | 0.449 | 0.379 |
| 5.592034923389623 | 0.552 | 0.451 | 0.381 |
| 5.595176516043213 | 0.554 | 0.453 | 0.383 |
| 5.598318108696803 | 0.555 | 0.454 | 0.385 |
| 5.601459701350392 | 0.557 | 0.456 | 0.386 |
| 5.604601294003982 | 0.559 | 0.458 | 0.388 |
| 5.607742886657571 | 0.561 | 0.46 | 0.39 |
| 5.610884479311161 | 0.563 | 0.462 | 0.392 |
| 5.61402607196475 | 0.565 | 0.464 | 0.394 |
| 5.61716766461834 | 0.567 | 0.466 | 0.396 |
| 5.62030925727193 | 0.569 | 0.468 | 0.398 |
| 5.623450849925519 | 0.571 | 0.47 | 0.4 |
| 5.626592442579109 | 0.573 | 0.472 | 0.402 |
| 5.629734035232698 | 0.575 | 0.474 | 0.403 |
| 5.632875627886288 | 0.577 | 0.476 | 0.405 |
| 5.636017220539878 | 0.579 | 0.478 | 0.407 |
| 5.639158813193467 | 0.581 | 0.48 | 0.409 |
| 5.642300405847057 | 0.583 | 0.483 | 0.412 |
| 5.645441998500646 | 0.585 | 0.485 | 0.414 |
| 5.648583591154236 | 0.587 | 0.487 | 0.416 |
| 5.651725183807825 | 0.589 | 0.489 | 0.418 |
| 5.654866776461415 | 0.591 | 0.491 | 0.42 |
| 5.658008369115005 | 0.593 | 0.493 | 0.422 |
| 5.661149961768594 | 0.596 | 0.495 | 0.424 |
| 5.664291554422184 | 0.598 | 0.498 | 0.426 |
| 5.667433147075774 | 0.6 | 0.5 | 0.428 |
| 5.670574739729363 | 0.602 | 0.502 | 0.431 |
| 5.673716332382953 | 0.604 | 0.504 | 0.433 |
| 5.676857925036542 | 0.606 | 0.507 | 0.435 |
| 5.679999517690132 | 0.608 | 0.509 | 0.437 |
| 5.683141110343721 | 0.611 | 0.511 | 0.439 |
| 5.686282702997311 | 0.613 | 0.513 | 0.442 |
| 5.689424295650901 | 0.615 | 0.516 | 0.444 |
| 5.69256588830449 | 0.617 | 0.518 | 0.446 |
| 5.69570748095808 | 0.619 | 0.52 | 0.449 |
| 5.69884907361167 | 0.622 | 0.523 | 0.451 |
| 5.701990666265259 | 0.624 | 0.525 | 0.453 |
| 5.705132258918849 | 0.626 | 0.528 | 0.456 |
| 5.708273851572438 | 0.628 | 0.53 | 0.458 |
| 5.711415444226028 | 0.631 | 0.532 | 0.461 |
| 5.714557036879618 | 0.633 | 0.535 | 0.463 |
| 5.717698629533207 | 0.635 | 0.537 | 0.465 |
| 5.720840222186797 | 0.638 | 0.54 | 0.468 |
| 5.723981814840386 | 0.64 | 0.542 | 0.47 |
| 5.727123407493976 | 0.642 | 0.545 | 0.473 |
| 5.730265000147565 | 0.644 | 0.547 | 0.475 |
| 5.733406592801155 | 0.647 | 0.55 | 0.478 |
| 5.736548185454744 | 0.649 | 0.552 | 0.481 |
| 5.739689778108334 | 0.652 | 0.555 | 0.483 |
| 5.742831370761924 | 0.654 | 0.557 | 0.486 |
| 5.745972963415514 | 0.656 | 0.56 | 0.488 |
| 5.749114556069103 | 0.659 | 0.563 | 0.491 |
| 5.752256148722693 | 0.661 | 0.565 | 0.494 |
| 5.755397741376282 | 0.663 | 0.568 | 0.496 |
| 5.758539334029872 | 0.666 | 0.571 | 0.499 |
| 5.761680926683462 | 0.668 | 0.573 | 0.502 |
| 5.764822519337051 | 0.671 | 0.576 | 0.505 |
| 5.767964111990641 | 0.673 | 0.579 | 0.507 |
| 5.77110570464423 | 0.676 | 0.581 | 0.51 |
| 5.77424729729782 | 0.678 | 0.584 | 0.513 |
| 5.77738888995141 | 0.681 | 0.587 | 0.516 |
| 5.780530482605 | 0.683 | 0.59 | 0.519 |
| 5.783672075258588 | 0.685 | 0.592 | 0.521 |
| 5.786813667912178 | 0.688 | 0.595 | 0.524 |
| 5.789955260565768 | 0.69 | 0.598 | 0.527 |
| 5.793096853219358 | 0.693 | 0.601 | 0.53 |
| 5.796238445872947 | 0.695 | 0.604 | 0.533 |
| 5.799380038526537 | 0.698 | 0.606 | 0.536 |
| 5.802521631180126 | 0.7 | 0.609 | 0.539 |
| 5.805663223833715 | 0.703 | 0.612 | 0.542 |
| 5.808804816487306 | 0.706 | 0.615 | 0.545 |
| 5.811946409140895 | 0.708 | 0.618 | 0.548 |
| 5.815088001794485 | 0.711 | 0.621 | 0.551 |
| 5.818229594448074 | 0.713 | 0.624 | 0.554 |
| 5.821371187101663 | 0.716 | 0.627 | 0.557 |
| 5.824512779755254 | 0.718 | 0.63 | 0.56 |
| 5.827654372408843 | 0.721 | 0.633 | 0.564 |
| 5.830795965062433 | 0.724 | 0.636 | 0.567 |
| 5.833937557716022 | 0.726 | 0.639 | 0.57 |
| 5.837079150369612 | 0.729 | 0.642 | 0.573 |
| 5.840220743023201 | 0.731 | 0.645 | 0.576 |
| 5.843362335676791 | 0.734 | 0.648 | 0.58 |
| 5.846503928330381 | 0.737 | 0.651 | 0.583 |
| 5.84964552098397 | 0.739 | 0.654 | 0.586 |
| 5.85278711363756 | 0.742 | 0.657 | 0.59 |
| 5.85592870629115 | 0.744 | 0.66 | 0.593 |
| 5.85907029894474 | 0.747 | 0.663 | 0.596 |
| 5.862211891598329 | 0.75 | 0.666 | 0.6 |
| 5.865353484251918 | 0.752 | 0.669 | 0.603 |
| 5.868495076905508 | 0.755 | 0.672 | 0.606 |
| 5.871636669559098 | 0.758 | 0.676 | 0.61 |
| 5.874778262212687 | 0.76 | 0.679 | 0.613 |
| 5.877919854866277 | 0.763 | 0.682 | 0.617 |
| 5.881061447519866 | 0.765 | 0.685 | 0.62 |
| 5.884203040173456 | 0.768 | 0.688 | 0.624 |
| 5.887344632827046 | 0.771 | 0.692 | 0.627 |
| 5.890486225480635 | 0.773 | 0.695 | 0.631 |
| 5.893627818134224 | 0.776 | 0.698 | 0.634 |
| 5.896769410787814 | 0.779 | 0.701 | 0.638 |
| 5.899911003441404 | 0.781 | 0.704 | 0.641 |
| 5.903052596094994 | 0.784 | 0.708 | 0.645 |
| 5.906194188748583 | 0.787 | 0.711 | 0.648 |
| 5.909335781402172 | 0.789 | 0.714 | 0.652 |
| 5.912477374055762 | 0.792 | 0.717 | 0.656 |
| 5.915618966709352 | 0.795 | 0.721 | 0.659 |
| 5.918760559362942 | 0.797 | 0.724 | 0.663 |
| 5.921902152016531 | 0.8 | 0.727 | 0.667 |
| 5.92504374467012 | 0.803 | 0.731 | 0.67 |
| 5.92818533732371 | 0.805 | 0.734 | 0.674 |
| 5.9313269299773 | 0.808 | 0.737 | 0.678 |
| 5.93446852263089 | 0.811 | 0.741 | 0.682 |
| 5.93761011528448 | 0.813 | 0.744 | 0.685 |
| 5.940751707938068 | 0.816 | 0.747 | 0.689 |
| 5.943893300591658 | 0.819 | 0.751 | 0.693 |
| 5.947034893245248 | 0.821 | 0.754 | 0.697 |
| 5.950176485898837 | 0.824 | 0.757 | 0.701 |
| 5.953318078552427 | 0.827 | 0.761 | 0.704 |
| 5.956459671206017 | 0.829 | 0.764 | 0.708 |
| 5.959601263859606 | 0.832 | 0.767 | 0.712 |
| 5.962742856513196 | 0.834 | 0.771 | 0.716 |
| 5.965884449166785 | 0.837 | 0.774 | 0.72 |
| 5.969026041820375 | 0.84 | 0.777 | 0.724 |
| 5.972167634473964 | 0.842 | 0.781 | 0.727 |
| 5.975309227127554 | 0.845 | 0.784 | 0.731 |
| 5.978450819781144 | 0.847 | 0.787 | 0.735 |
| 5.981592412434733 | 0.85 | 0.791 | 0.739 |
| 5.984734005088323 | 0.853 | 0.794 | 0.743 |
| 5.987875597741913 | 0.855 | 0.797 | 0.747 |
| 5.991017190395502 | 0.858 | 0.801 | 0.751 |
| 5.994158783049092 | 0.86 | 0.804 | 0.755 |
| 5.997300375702681 | 0.863 | 0.807 | 0.759 |
| 6.000441968356271 | 0.865 | 0.811 | 0.763 |
| 6.003583561009861 | 0.868 | 0.814 | 0.766 |
| 6.00672515366345 | 0.87 | 0.817 | 0.77 |
| 6.00986674631704 | 0.873 | 0.821 | 0.774 |
| 6.01300833897063 | 0.875 | 0.824 | 0.778 |
| 6.01614993162422 | 0.878 | 0.827 | 0.782 |
| 6.019291524277808 | 0.88 | 0.83 | 0.786 |
| 6.022433116931398 | 0.883 | 0.834 | 0.79 |
| 6.025574709584988 | 0.885 | 0.837 | 0.794 |
| 6.028716302238577 | 0.888 | 0.84 | 0.798 |
| 6.031857894892167 | 0.89 | 0.843 | 0.802 |
| 6.034999487545757 | 0.892 | 0.847 | 0.806 |
| 6.038141080199346 | 0.895 | 0.85 | 0.809 |
| 6.041282672852935 | 0.897 | 0.853 | 0.813 |
| 6.044424265506525 | 0.899 | 0.856 | 0.817 |
| 6.047565858160115 | 0.902 | 0.859 | 0.821 |
| 6.050707450813704 | 0.904 | 0.863 | 0.825 |
| 6.053849043467294 | 0.906 | 0.866 | 0.829 |
| 6.056990636120884 | 0.909 | 0.869 | 0.833 |
| 6.060132228774473 | 0.911 | 0.872 | 0.836 |
| 6.063273821428063 | 0.913 | 0.875 | 0.84 |
| 6.066415414081653 | 0.915 | 0.878 | 0.844 |
| 6.069557006735242 | 0.918 | 0.881 | 0.848 |
| 6.072698599388831 | 0.92 | 0.884 | 0.851 |
| 6.07584019204242 | 0.922 | 0.887 | 0.855 |
| 6.078981784696011 | 0.924 | 0.89 | 0.859 |
| 6.082123377349601 | 0.926 | 0.893 | 0.862 |
| 6.08526497000319 | 0.928 | 0.896 | 0.866 |
| 6.08840656265678 | 0.93 | 0.899 | 0.87 |
| 6.09154815531037 | 0.932 | 0.902 | 0.873 |
| 6.094689747963959 | 0.934 | 0.905 | 0.877 |
| 6.097831340617549 | 0.936 | 0.908 | 0.88 |
| 6.100972933271138 | 0.938 | 0.91 | 0.884 |
| 6.104114525924728 | 0.94 | 0.913 | 0.887 |
| 6.107256118578317 | 0.942 | 0.916 | 0.891 |
| 6.110397711231907 | 0.944 | 0.919 | 0.894 |
| 6.113539303885497 | 0.946 | 0.921 | 0.898 |
| 6.116680896539086 | 0.948 | 0.924 | 0.901 |
| 6.119822489192675 | 0.95 | 0.926 | 0.904 |
| 6.122964081846265 | 0.952 | 0.929 | 0.908 |
| 6.126105674499855 | 0.953 | 0.932 | 0.911 |
| 6.129247267153445 | 0.955 | 0.934 | 0.914 |
| 6.132388859807034 | 0.957 | 0.937 | 0.917 |
| 6.135530452460624 | 0.959 | 0.939 | 0.92 |
| 6.138672045114213 | 0.96 | 0.941 | 0.923 |
| 6.141813637767803 | 0.962 | 0.944 | 0.926 |
| 6.144955230421393 | 0.963 | 0.946 | 0.929 |
| 6.148096823074982 | 0.965 | 0.948 | 0.932 |
| 6.151238415728571 | 0.967 | 0.951 | 0.935 |
| 6.154380008382161 | 0.968 | 0.953 | 0.938 |
| 6.157521601035751 | 0.97 | 0.955 | 0.941 |
| 6.16066319368934 | 0.971 | 0.957 | 0.944 |
| 6.16380478634293 | 0.972 | 0.959 | 0.946 |
| 6.16694637899652 | 0.974 | 0.961 | 0.949 |
| 6.170087971650109 | 0.975 | 0.963 | 0.952 |
| 6.173229564303698 | 0.976 | 0.965 | 0.954 |
| 6.176371156957289 | 0.978 | 0.967 | 0.957 |
| 6.179512749610878 | 0.979 | 0.969 | 0.959 |
| 6.182654342264468 | 0.98 | 0.971 | 0.961 |
| 6.185795934918057 | 0.981 | 0.972 | 0.964 |
| 6.188937527571647 | 0.983 | 0.974 | 0.966 |
| 6.192079120225237 | 0.984 | 0.976 | 0.968 |
| 6.195220712878826 | 0.985 | 0.977 | 0.97 |
| 6.198362305532415 | 0.986 | 0.979 | 0.972 |
| 6.201503898186005 | 0.987 | 0.98 | 0.974 |
| 6.204645490839594 | 0.988 | 0.982 | 0.976 |
| 6.207787083493184 | 0.989 | 0.983 | 0.978 |
| 6.210928676146774 | 0.99 | 0.985 | 0.98 |
| 6.214070268800364 | 0.991 | 0.986 | 0.981 |
| 6.217211861453953 | 0.991 | 0.987 | 0.983 |
| 6.220353454107543 | 0.992 | 0.988 | 0.984 |
| 6.223495046761133 | 0.993 | 0.989 | 0.986 |
| 6.226636639414722 | 0.994 | 0.991 | 0.987 |
| 6.229778232068312 | 0.994 | 0.992 | 0.989 |
| 6.232919824721901 | 0.995 | 0.992 | 0.99 |
| 6.236061417375491 | 0.996 | 0.993 | 0.991 |
| 6.23920301002908 | 0.996 | 0.994 | 0.992 |
| 6.24234460268267 | 0.997 | 0.995 | 0.993 |
| 6.24548619533626 | 0.997 | 0.996 | 0.994 |
| 6.24862778798985 | 0.998 | 0.996 | 0.995 |
| 6.251769380643438 | 0.998 | 0.997 | 0.996 |
| 6.254910973297028 | 0.998 | 0.998 | 0.997 |
| 6.258052565950618 | 0.999 | 0.998 | 0.997 |
| 6.261194158604208 | 0.999 | 0.999 | 0.998 |
| 6.264335751257797 | 0.999 | 0.999 | 0.999 |
| 6.267477343911387 | 1 | 0.999 | 0.999 |
| 6.270618936564976 | 1 | 1 | 0.999 |
| 6.273760529218566 | 1 | 1 | 1 |
| 6.276902121872155 | 1 | 1 | 1 |
| 6.280043714525745 | 1 | 1 | 1 |
| 6.283185307179335 | 1 | 1 | 1 |